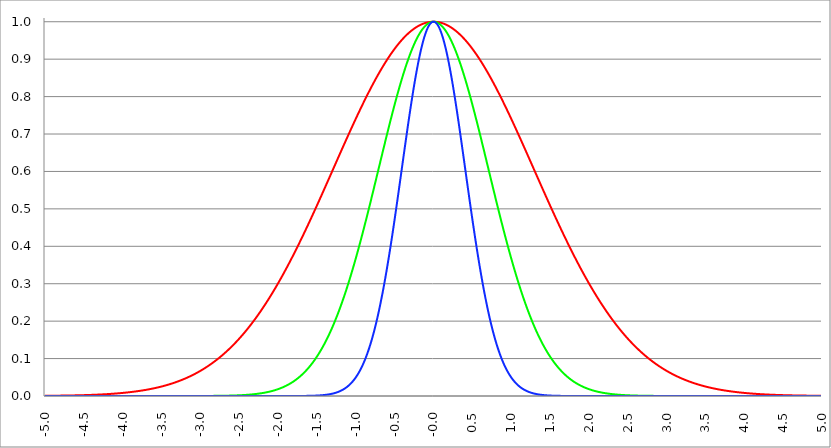
| Category | Series 1 | Series 0 | Series 2 |
|---|---|---|---|
| -5.0 | 0.001 | 0 | 0 |
| -4.995 | 0.001 | 0 | 0 |
| -4.99 | 0.001 | 0 | 0 |
| -4.985 | 0.001 | 0 | 0 |
| -4.98 | 0.001 | 0 | 0 |
| -4.975 | 0.001 | 0 | 0 |
| -4.97 | 0.001 | 0 | 0 |
| -4.965000000000001 | 0.001 | 0 | 0 |
| -4.960000000000001 | 0.001 | 0 | 0 |
| -4.955000000000001 | 0.001 | 0 | 0 |
| -4.950000000000001 | 0.001 | 0 | 0 |
| -4.945000000000001 | 0.001 | 0 | 0 |
| -4.940000000000001 | 0.001 | 0 | 0 |
| -4.935000000000001 | 0.001 | 0 | 0 |
| -4.930000000000001 | 0.001 | 0 | 0 |
| -4.925000000000002 | 0.001 | 0 | 0 |
| -4.920000000000002 | 0.001 | 0 | 0 |
| -4.915000000000002 | 0.001 | 0 | 0 |
| -4.910000000000002 | 0.001 | 0 | 0 |
| -4.905000000000002 | 0.001 | 0 | 0 |
| -4.900000000000002 | 0.001 | 0 | 0 |
| -4.895000000000002 | 0.001 | 0 | 0 |
| -4.890000000000002 | 0.001 | 0 | 0 |
| -4.885000000000002 | 0.001 | 0 | 0 |
| -4.880000000000002 | 0.001 | 0 | 0 |
| -4.875000000000003 | 0.001 | 0 | 0 |
| -4.870000000000003 | 0.001 | 0 | 0 |
| -4.865000000000003 | 0.001 | 0 | 0 |
| -4.860000000000003 | 0.001 | 0 | 0 |
| -4.855000000000003 | 0.001 | 0 | 0 |
| -4.850000000000003 | 0.001 | 0 | 0 |
| -4.845000000000003 | 0.001 | 0 | 0 |
| -4.840000000000003 | 0.001 | 0 | 0 |
| -4.835000000000003 | 0.001 | 0 | 0 |
| -4.830000000000004 | 0.001 | 0 | 0 |
| -4.825000000000004 | 0.001 | 0 | 0 |
| -4.820000000000004 | 0.001 | 0 | 0 |
| -4.815000000000004 | 0.001 | 0 | 0 |
| -4.810000000000004 | 0.001 | 0 | 0 |
| -4.805000000000004 | 0.001 | 0 | 0 |
| -4.800000000000004 | 0.001 | 0 | 0 |
| -4.795000000000004 | 0.001 | 0 | 0 |
| -4.790000000000004 | 0.001 | 0 | 0 |
| -4.785000000000004 | 0.001 | 0 | 0 |
| -4.780000000000004 | 0.001 | 0 | 0 |
| -4.775000000000004 | 0.001 | 0 | 0 |
| -4.770000000000004 | 0.001 | 0 | 0 |
| -4.765000000000005 | 0.001 | 0 | 0 |
| -4.760000000000005 | 0.001 | 0 | 0 |
| -4.755000000000005 | 0.001 | 0 | 0 |
| -4.750000000000005 | 0.001 | 0 | 0 |
| -4.745000000000005 | 0.001 | 0 | 0 |
| -4.740000000000005 | 0.001 | 0 | 0 |
| -4.735000000000005 | 0.001 | 0 | 0 |
| -4.730000000000005 | 0.001 | 0 | 0 |
| -4.725000000000006 | 0.001 | 0 | 0 |
| -4.720000000000006 | 0.001 | 0 | 0 |
| -4.715000000000006 | 0.001 | 0 | 0 |
| -4.710000000000006 | 0.001 | 0 | 0 |
| -4.705000000000006 | 0.001 | 0 | 0 |
| -4.700000000000006 | 0.001 | 0 | 0 |
| -4.695000000000006 | 0.001 | 0 | 0 |
| -4.690000000000006 | 0.001 | 0 | 0 |
| -4.685000000000007 | 0.001 | 0 | 0 |
| -4.680000000000007 | 0.001 | 0 | 0 |
| -4.675000000000007 | 0.001 | 0 | 0 |
| -4.670000000000007 | 0.001 | 0 | 0 |
| -4.665000000000007 | 0.001 | 0 | 0 |
| -4.660000000000007 | 0.001 | 0 | 0 |
| -4.655000000000007 | 0.002 | 0 | 0 |
| -4.650000000000007 | 0.002 | 0 | 0 |
| -4.645000000000007 | 0.002 | 0 | 0 |
| -4.640000000000008 | 0.002 | 0 | 0 |
| -4.635000000000008 | 0.002 | 0 | 0 |
| -4.630000000000008 | 0.002 | 0 | 0 |
| -4.625000000000008 | 0.002 | 0 | 0 |
| -4.620000000000008 | 0.002 | 0 | 0 |
| -4.615000000000008 | 0.002 | 0 | 0 |
| -4.610000000000008 | 0.002 | 0 | 0 |
| -4.605000000000008 | 0.002 | 0 | 0 |
| -4.600000000000008 | 0.002 | 0 | 0 |
| -4.595000000000009 | 0.002 | 0 | 0 |
| -4.590000000000009 | 0.002 | 0 | 0 |
| -4.585000000000009 | 0.002 | 0 | 0 |
| -4.580000000000009 | 0.002 | 0 | 0 |
| -4.57500000000001 | 0.002 | 0 | 0 |
| -4.57000000000001 | 0.002 | 0 | 0 |
| -4.565000000000009 | 0.002 | 0 | 0 |
| -4.560000000000009 | 0.002 | 0 | 0 |
| -4.555000000000009 | 0.002 | 0 | 0 |
| -4.55000000000001 | 0.002 | 0 | 0 |
| -4.54500000000001 | 0.002 | 0 | 0 |
| -4.54000000000001 | 0.002 | 0 | 0 |
| -4.53500000000001 | 0.002 | 0 | 0 |
| -4.53000000000001 | 0.002 | 0 | 0 |
| -4.52500000000001 | 0.002 | 0 | 0 |
| -4.52000000000001 | 0.002 | 0 | 0 |
| -4.51500000000001 | 0.002 | 0 | 0 |
| -4.51000000000001 | 0.002 | 0 | 0 |
| -4.505000000000011 | 0.002 | 0 | 0 |
| -4.500000000000011 | 0.002 | 0 | 0 |
| -4.495000000000011 | 0.002 | 0 | 0 |
| -4.490000000000011 | 0.002 | 0 | 0 |
| -4.485000000000011 | 0.002 | 0 | 0 |
| -4.480000000000011 | 0.002 | 0 | 0 |
| -4.475000000000011 | 0.002 | 0 | 0 |
| -4.470000000000011 | 0.002 | 0 | 0 |
| -4.465000000000011 | 0.003 | 0 | 0 |
| -4.460000000000011 | 0.003 | 0 | 0 |
| -4.455000000000012 | 0.003 | 0 | 0 |
| -4.450000000000012 | 0.003 | 0 | 0 |
| -4.445000000000012 | 0.003 | 0 | 0 |
| -4.440000000000012 | 0.003 | 0 | 0 |
| -4.435000000000012 | 0.003 | 0 | 0 |
| -4.430000000000012 | 0.003 | 0 | 0 |
| -4.425000000000012 | 0.003 | 0 | 0 |
| -4.420000000000012 | 0.003 | 0 | 0 |
| -4.415000000000012 | 0.003 | 0 | 0 |
| -4.410000000000013 | 0.003 | 0 | 0 |
| -4.405000000000013 | 0.003 | 0 | 0 |
| -4.400000000000013 | 0.003 | 0 | 0 |
| -4.395000000000013 | 0.003 | 0 | 0 |
| -4.390000000000013 | 0.003 | 0 | 0 |
| -4.385000000000013 | 0.003 | 0 | 0 |
| -4.380000000000013 | 0.003 | 0 | 0 |
| -4.375000000000013 | 0.003 | 0 | 0 |
| -4.370000000000013 | 0.003 | 0 | 0 |
| -4.365000000000013 | 0.003 | 0 | 0 |
| -4.360000000000014 | 0.003 | 0 | 0 |
| -4.355000000000014 | 0.003 | 0 | 0 |
| -4.350000000000014 | 0.003 | 0 | 0 |
| -4.345000000000014 | 0.003 | 0 | 0 |
| -4.340000000000014 | 0.004 | 0 | 0 |
| -4.335000000000014 | 0.004 | 0 | 0 |
| -4.330000000000014 | 0.004 | 0 | 0 |
| -4.325000000000014 | 0.004 | 0 | 0 |
| -4.320000000000014 | 0.004 | 0 | 0 |
| -4.315000000000015 | 0.004 | 0 | 0 |
| -4.310000000000015 | 0.004 | 0 | 0 |
| -4.305000000000015 | 0.004 | 0 | 0 |
| -4.300000000000015 | 0.004 | 0 | 0 |
| -4.295000000000015 | 0.004 | 0 | 0 |
| -4.290000000000015 | 0.004 | 0 | 0 |
| -4.285000000000015 | 0.004 | 0 | 0 |
| -4.280000000000015 | 0.004 | 0 | 0 |
| -4.275000000000015 | 0.004 | 0 | 0 |
| -4.270000000000015 | 0.004 | 0 | 0 |
| -4.265000000000016 | 0.004 | 0 | 0 |
| -4.260000000000016 | 0.004 | 0 | 0 |
| -4.255000000000016 | 0.004 | 0 | 0 |
| -4.250000000000016 | 0.004 | 0 | 0 |
| -4.245000000000016 | 0.004 | 0 | 0 |
| -4.240000000000016 | 0.005 | 0 | 0 |
| -4.235000000000016 | 0.005 | 0 | 0 |
| -4.230000000000016 | 0.005 | 0 | 0 |
| -4.225000000000017 | 0.005 | 0 | 0 |
| -4.220000000000017 | 0.005 | 0 | 0 |
| -4.215000000000017 | 0.005 | 0 | 0 |
| -4.210000000000017 | 0.005 | 0 | 0 |
| -4.205000000000017 | 0.005 | 0 | 0 |
| -4.200000000000017 | 0.005 | 0 | 0 |
| -4.195000000000017 | 0.005 | 0 | 0 |
| -4.190000000000017 | 0.005 | 0 | 0 |
| -4.185000000000017 | 0.005 | 0 | 0 |
| -4.180000000000017 | 0.005 | 0 | 0 |
| -4.175000000000018 | 0.005 | 0 | 0 |
| -4.170000000000018 | 0.005 | 0 | 0 |
| -4.165000000000018 | 0.005 | 0 | 0 |
| -4.160000000000018 | 0.006 | 0 | 0 |
| -4.155000000000018 | 0.006 | 0 | 0 |
| -4.150000000000018 | 0.006 | 0 | 0 |
| -4.145000000000018 | 0.006 | 0 | 0 |
| -4.140000000000018 | 0.006 | 0 | 0 |
| -4.135000000000018 | 0.006 | 0 | 0 |
| -4.130000000000019 | 0.006 | 0 | 0 |
| -4.125000000000019 | 0.006 | 0 | 0 |
| -4.120000000000019 | 0.006 | 0 | 0 |
| -4.115000000000019 | 0.006 | 0 | 0 |
| -4.110000000000019 | 0.006 | 0 | 0 |
| -4.105000000000019 | 0.006 | 0 | 0 |
| -4.100000000000019 | 0.006 | 0 | 0 |
| -4.095000000000019 | 0.007 | 0 | 0 |
| -4.090000000000019 | 0.007 | 0 | 0 |
| -4.085000000000019 | 0.007 | 0 | 0 |
| -4.08000000000002 | 0.007 | 0 | 0 |
| -4.07500000000002 | 0.007 | 0 | 0 |
| -4.07000000000002 | 0.007 | 0 | 0 |
| -4.06500000000002 | 0.007 | 0 | 0 |
| -4.06000000000002 | 0.007 | 0 | 0 |
| -4.05500000000002 | 0.007 | 0 | 0 |
| -4.05000000000002 | 0.007 | 0 | 0 |
| -4.04500000000002 | 0.007 | 0 | 0 |
| -4.04000000000002 | 0.007 | 0 | 0 |
| -4.03500000000002 | 0.008 | 0 | 0 |
| -4.03000000000002 | 0.008 | 0 | 0 |
| -4.025000000000021 | 0.008 | 0 | 0 |
| -4.020000000000021 | 0.008 | 0 | 0 |
| -4.015000000000021 | 0.008 | 0 | 0 |
| -4.010000000000021 | 0.008 | 0 | 0 |
| -4.005000000000021 | 0.008 | 0 | 0 |
| -4.000000000000021 | 0.008 | 0 | 0 |
| -3.995000000000021 | 0.008 | 0 | 0 |
| -3.990000000000021 | 0.008 | 0 | 0 |
| -3.985000000000022 | 0.009 | 0 | 0 |
| -3.980000000000022 | 0.009 | 0 | 0 |
| -3.975000000000022 | 0.009 | 0 | 0 |
| -3.970000000000022 | 0.009 | 0 | 0 |
| -3.965000000000022 | 0.009 | 0 | 0 |
| -3.960000000000022 | 0.009 | 0 | 0 |
| -3.955000000000022 | 0.009 | 0 | 0 |
| -3.950000000000022 | 0.009 | 0 | 0 |
| -3.945000000000022 | 0.009 | 0 | 0 |
| -3.940000000000023 | 0.009 | 0 | 0 |
| -3.935000000000023 | 0.01 | 0 | 0 |
| -3.930000000000023 | 0.01 | 0 | 0 |
| -3.925000000000023 | 0.01 | 0 | 0 |
| -3.920000000000023 | 0.01 | 0 | 0 |
| -3.915000000000023 | 0.01 | 0 | 0 |
| -3.910000000000023 | 0.01 | 0 | 0 |
| -3.905000000000023 | 0.01 | 0 | 0 |
| -3.900000000000023 | 0.01 | 0 | 0 |
| -3.895000000000023 | 0.011 | 0 | 0 |
| -3.890000000000024 | 0.011 | 0 | 0 |
| -3.885000000000024 | 0.011 | 0 | 0 |
| -3.880000000000024 | 0.011 | 0 | 0 |
| -3.875000000000024 | 0.011 | 0 | 0 |
| -3.870000000000024 | 0.011 | 0 | 0 |
| -3.865000000000024 | 0.011 | 0 | 0 |
| -3.860000000000024 | 0.011 | 0 | 0 |
| -3.855000000000024 | 0.012 | 0 | 0 |
| -3.850000000000024 | 0.012 | 0 | 0 |
| -3.845000000000025 | 0.012 | 0 | 0 |
| -3.840000000000025 | 0.012 | 0 | 0 |
| -3.835000000000025 | 0.012 | 0 | 0 |
| -3.830000000000025 | 0.012 | 0 | 0 |
| -3.825000000000025 | 0.012 | 0 | 0 |
| -3.820000000000025 | 0.013 | 0 | 0 |
| -3.815000000000025 | 0.013 | 0 | 0 |
| -3.810000000000025 | 0.013 | 0 | 0 |
| -3.805000000000025 | 0.013 | 0 | 0 |
| -3.800000000000026 | 0.013 | 0 | 0 |
| -3.795000000000026 | 0.013 | 0 | 0 |
| -3.790000000000026 | 0.013 | 0 | 0 |
| -3.785000000000026 | 0.014 | 0 | 0 |
| -3.780000000000026 | 0.014 | 0 | 0 |
| -3.775000000000026 | 0.014 | 0 | 0 |
| -3.770000000000026 | 0.014 | 0 | 0 |
| -3.765000000000026 | 0.014 | 0 | 0 |
| -3.760000000000026 | 0.014 | 0 | 0 |
| -3.755000000000026 | 0.015 | 0 | 0 |
| -3.750000000000027 | 0.015 | 0 | 0 |
| -3.745000000000027 | 0.015 | 0 | 0 |
| -3.740000000000027 | 0.015 | 0 | 0 |
| -3.735000000000027 | 0.015 | 0 | 0 |
| -3.730000000000027 | 0.015 | 0 | 0 |
| -3.725000000000027 | 0.016 | 0 | 0 |
| -3.720000000000027 | 0.016 | 0 | 0 |
| -3.715000000000027 | 0.016 | 0 | 0 |
| -3.710000000000027 | 0.016 | 0 | 0 |
| -3.705000000000028 | 0.016 | 0 | 0 |
| -3.700000000000028 | 0.016 | 0 | 0 |
| -3.695000000000028 | 0.017 | 0 | 0 |
| -3.690000000000028 | 0.017 | 0 | 0 |
| -3.685000000000028 | 0.017 | 0 | 0 |
| -3.680000000000028 | 0.017 | 0 | 0 |
| -3.675000000000028 | 0.017 | 0 | 0 |
| -3.670000000000028 | 0.018 | 0 | 0 |
| -3.665000000000028 | 0.018 | 0 | 0 |
| -3.660000000000028 | 0.018 | 0 | 0 |
| -3.655000000000029 | 0.018 | 0 | 0 |
| -3.650000000000029 | 0.018 | 0 | 0 |
| -3.645000000000029 | 0.019 | 0 | 0 |
| -3.640000000000029 | 0.019 | 0 | 0 |
| -3.635000000000029 | 0.019 | 0 | 0 |
| -3.630000000000029 | 0.019 | 0 | 0 |
| -3.625000000000029 | 0.019 | 0 | 0 |
| -3.620000000000029 | 0.02 | 0 | 0 |
| -3.615000000000029 | 0.02 | 0 | 0 |
| -3.61000000000003 | 0.02 | 0 | 0 |
| -3.60500000000003 | 0.02 | 0 | 0 |
| -3.60000000000003 | 0.02 | 0 | 0 |
| -3.59500000000003 | 0.021 | 0 | 0 |
| -3.59000000000003 | 0.021 | 0 | 0 |
| -3.58500000000003 | 0.021 | 0 | 0 |
| -3.58000000000003 | 0.021 | 0 | 0 |
| -3.57500000000003 | 0.022 | 0 | 0 |
| -3.57000000000003 | 0.022 | 0 | 0 |
| -3.565000000000031 | 0.022 | 0 | 0 |
| -3.560000000000031 | 0.022 | 0 | 0 |
| -3.555000000000031 | 0.023 | 0 | 0 |
| -3.550000000000031 | 0.023 | 0 | 0 |
| -3.545000000000031 | 0.023 | 0 | 0 |
| -3.540000000000031 | 0.023 | 0 | 0 |
| -3.535000000000031 | 0.024 | 0 | 0 |
| -3.530000000000031 | 0.024 | 0 | 0 |
| -3.525000000000031 | 0.024 | 0 | 0 |
| -3.520000000000032 | 0.024 | 0 | 0 |
| -3.515000000000032 | 0.025 | 0 | 0 |
| -3.510000000000032 | 0.025 | 0 | 0 |
| -3.505000000000032 | 0.025 | 0 | 0 |
| -3.500000000000032 | 0.025 | 0 | 0 |
| -3.495000000000032 | 0.026 | 0 | 0 |
| -3.490000000000032 | 0.026 | 0 | 0 |
| -3.485000000000032 | 0.026 | 0 | 0 |
| -3.480000000000032 | 0.026 | 0 | 0 |
| -3.475000000000032 | 0.027 | 0 | 0 |
| -3.470000000000033 | 0.027 | 0 | 0 |
| -3.465000000000033 | 0.027 | 0 | 0 |
| -3.460000000000033 | 0.028 | 0 | 0 |
| -3.455000000000033 | 0.028 | 0 | 0 |
| -3.450000000000033 | 0.028 | 0 | 0 |
| -3.445000000000033 | 0.028 | 0 | 0 |
| -3.440000000000033 | 0.029 | 0 | 0 |
| -3.435000000000033 | 0.029 | 0 | 0 |
| -3.430000000000033 | 0.029 | 0 | 0 |
| -3.425000000000034 | 0.03 | 0 | 0 |
| -3.420000000000034 | 0.03 | 0 | 0 |
| -3.415000000000034 | 0.03 | 0 | 0 |
| -3.410000000000034 | 0.031 | 0 | 0 |
| -3.405000000000034 | 0.031 | 0 | 0 |
| -3.400000000000034 | 0.031 | 0 | 0 |
| -3.395000000000034 | 0.031 | 0 | 0 |
| -3.390000000000034 | 0.032 | 0 | 0 |
| -3.385000000000034 | 0.032 | 0 | 0 |
| -3.380000000000034 | 0.032 | 0 | 0 |
| -3.375000000000035 | 0.033 | 0 | 0 |
| -3.370000000000035 | 0.033 | 0 | 0 |
| -3.365000000000035 | 0.033 | 0 | 0 |
| -3.360000000000035 | 0.034 | 0 | 0 |
| -3.355000000000035 | 0.034 | 0 | 0 |
| -3.350000000000035 | 0.035 | 0 | 0 |
| -3.345000000000035 | 0.035 | 0 | 0 |
| -3.340000000000035 | 0.035 | 0 | 0 |
| -3.335000000000035 | 0.036 | 0 | 0 |
| -3.330000000000036 | 0.036 | 0 | 0 |
| -3.325000000000036 | 0.036 | 0 | 0 |
| -3.320000000000036 | 0.037 | 0 | 0 |
| -3.315000000000036 | 0.037 | 0 | 0 |
| -3.310000000000036 | 0.037 | 0 | 0 |
| -3.305000000000036 | 0.038 | 0 | 0 |
| -3.300000000000036 | 0.038 | 0 | 0 |
| -3.295000000000036 | 0.038 | 0 | 0 |
| -3.290000000000036 | 0.039 | 0 | 0 |
| -3.285000000000036 | 0.039 | 0 | 0 |
| -3.280000000000036 | 0.04 | 0 | 0 |
| -3.275000000000037 | 0.04 | 0 | 0 |
| -3.270000000000037 | 0.04 | 0 | 0 |
| -3.265000000000037 | 0.041 | 0 | 0 |
| -3.260000000000037 | 0.041 | 0 | 0 |
| -3.255000000000037 | 0.042 | 0 | 0 |
| -3.250000000000037 | 0.042 | 0 | 0 |
| -3.245000000000037 | 0.042 | 0 | 0 |
| -3.240000000000037 | 0.043 | 0 | 0 |
| -3.235000000000038 | 0.043 | 0 | 0 |
| -3.230000000000038 | 0.044 | 0 | 0 |
| -3.225000000000038 | 0.044 | 0 | 0 |
| -3.220000000000038 | 0.045 | 0 | 0 |
| -3.215000000000038 | 0.045 | 0 | 0 |
| -3.210000000000038 | 0.045 | 0 | 0 |
| -3.205000000000038 | 0.046 | 0 | 0 |
| -3.200000000000038 | 0.046 | 0 | 0 |
| -3.195000000000038 | 0.047 | 0 | 0 |
| -3.190000000000039 | 0.047 | 0 | 0 |
| -3.185000000000039 | 0.048 | 0 | 0 |
| -3.180000000000039 | 0.048 | 0 | 0 |
| -3.175000000000039 | 0.049 | 0 | 0 |
| -3.170000000000039 | 0.049 | 0 | 0 |
| -3.16500000000004 | 0.05 | 0 | 0 |
| -3.16000000000004 | 0.05 | 0 | 0 |
| -3.155000000000039 | 0.05 | 0 | 0 |
| -3.150000000000039 | 0.051 | 0 | 0 |
| -3.14500000000004 | 0.051 | 0 | 0 |
| -3.14000000000004 | 0.052 | 0 | 0 |
| -3.13500000000004 | 0.052 | 0 | 0 |
| -3.13000000000004 | 0.053 | 0 | 0 |
| -3.12500000000004 | 0.053 | 0 | 0 |
| -3.12000000000004 | 0.054 | 0 | 0 |
| -3.11500000000004 | 0.054 | 0 | 0 |
| -3.11000000000004 | 0.055 | 0 | 0 |
| -3.10500000000004 | 0.055 | 0 | 0 |
| -3.10000000000004 | 0.056 | 0 | 0 |
| -3.095000000000041 | 0.056 | 0 | 0 |
| -3.090000000000041 | 0.057 | 0 | 0 |
| -3.085000000000041 | 0.058 | 0 | 0 |
| -3.080000000000041 | 0.058 | 0 | 0 |
| -3.075000000000041 | 0.059 | 0 | 0 |
| -3.070000000000041 | 0.059 | 0 | 0 |
| -3.065000000000041 | 0.06 | 0 | 0 |
| -3.060000000000041 | 0.06 | 0 | 0 |
| -3.055000000000041 | 0.061 | 0 | 0 |
| -3.050000000000042 | 0.061 | 0 | 0 |
| -3.045000000000042 | 0.062 | 0 | 0 |
| -3.040000000000042 | 0.063 | 0 | 0 |
| -3.035000000000042 | 0.063 | 0 | 0 |
| -3.030000000000042 | 0.064 | 0 | 0 |
| -3.025000000000042 | 0.064 | 0 | 0 |
| -3.020000000000042 | 0.065 | 0 | 0 |
| -3.015000000000042 | 0.065 | 0 | 0 |
| -3.010000000000042 | 0.066 | 0 | 0 |
| -3.005000000000043 | 0.067 | 0 | 0 |
| -3.000000000000043 | 0.067 | 0 | 0 |
| -2.995000000000043 | 0.068 | 0 | 0 |
| -2.990000000000043 | 0.068 | 0 | 0 |
| -2.985000000000043 | 0.069 | 0 | 0 |
| -2.980000000000043 | 0.07 | 0 | 0 |
| -2.975000000000043 | 0.07 | 0 | 0 |
| -2.970000000000043 | 0.071 | 0 | 0 |
| -2.965000000000043 | 0.072 | 0 | 0 |
| -2.960000000000043 | 0.072 | 0 | 0 |
| -2.955000000000044 | 0.073 | 0 | 0 |
| -2.950000000000044 | 0.073 | 0 | 0 |
| -2.945000000000044 | 0.074 | 0 | 0 |
| -2.940000000000044 | 0.075 | 0 | 0 |
| -2.935000000000044 | 0.075 | 0 | 0 |
| -2.930000000000044 | 0.076 | 0 | 0 |
| -2.925000000000044 | 0.077 | 0 | 0 |
| -2.920000000000044 | 0.077 | 0 | 0 |
| -2.915000000000044 | 0.078 | 0 | 0 |
| -2.910000000000045 | 0.079 | 0 | 0 |
| -2.905000000000045 | 0.08 | 0 | 0 |
| -2.900000000000045 | 0.08 | 0 | 0 |
| -2.895000000000045 | 0.081 | 0 | 0 |
| -2.890000000000045 | 0.082 | 0 | 0 |
| -2.885000000000045 | 0.082 | 0 | 0 |
| -2.880000000000045 | 0.083 | 0 | 0 |
| -2.875000000000045 | 0.084 | 0 | 0 |
| -2.870000000000045 | 0.084 | 0 | 0 |
| -2.865000000000045 | 0.085 | 0 | 0 |
| -2.860000000000046 | 0.086 | 0 | 0 |
| -2.855000000000046 | 0.087 | 0 | 0 |
| -2.850000000000046 | 0.087 | 0 | 0 |
| -2.845000000000046 | 0.088 | 0 | 0 |
| -2.840000000000046 | 0.089 | 0 | 0 |
| -2.835000000000046 | 0.09 | 0 | 0 |
| -2.830000000000046 | 0.09 | 0 | 0 |
| -2.825000000000046 | 0.091 | 0 | 0 |
| -2.820000000000046 | 0.092 | 0 | 0 |
| -2.815000000000047 | 0.093 | 0 | 0 |
| -2.810000000000047 | 0.094 | 0 | 0 |
| -2.805000000000047 | 0.094 | 0 | 0 |
| -2.800000000000047 | 0.095 | 0 | 0 |
| -2.795000000000047 | 0.096 | 0 | 0 |
| -2.790000000000047 | 0.097 | 0 | 0 |
| -2.785000000000047 | 0.098 | 0 | 0 |
| -2.780000000000047 | 0.098 | 0 | 0 |
| -2.775000000000047 | 0.099 | 0 | 0 |
| -2.770000000000047 | 0.1 | 0 | 0 |
| -2.765000000000048 | 0.101 | 0 | 0 |
| -2.760000000000048 | 0.102 | 0 | 0 |
| -2.755000000000048 | 0.103 | 0.001 | 0 |
| -2.750000000000048 | 0.103 | 0.001 | 0 |
| -2.745000000000048 | 0.104 | 0.001 | 0 |
| -2.740000000000048 | 0.105 | 0.001 | 0 |
| -2.735000000000048 | 0.106 | 0.001 | 0 |
| -2.730000000000048 | 0.107 | 0.001 | 0 |
| -2.725000000000048 | 0.108 | 0.001 | 0 |
| -2.720000000000049 | 0.109 | 0.001 | 0 |
| -2.715000000000049 | 0.11 | 0.001 | 0 |
| -2.710000000000049 | 0.11 | 0.001 | 0 |
| -2.705000000000049 | 0.111 | 0.001 | 0 |
| -2.700000000000049 | 0.112 | 0.001 | 0 |
| -2.695000000000049 | 0.113 | 0.001 | 0 |
| -2.690000000000049 | 0.114 | 0.001 | 0 |
| -2.685000000000049 | 0.115 | 0.001 | 0 |
| -2.680000000000049 | 0.116 | 0.001 | 0 |
| -2.675000000000049 | 0.117 | 0.001 | 0 |
| -2.67000000000005 | 0.118 | 0.001 | 0 |
| -2.66500000000005 | 0.119 | 0.001 | 0 |
| -2.66000000000005 | 0.12 | 0.001 | 0 |
| -2.65500000000005 | 0.121 | 0.001 | 0 |
| -2.65000000000005 | 0.122 | 0.001 | 0 |
| -2.64500000000005 | 0.123 | 0.001 | 0 |
| -2.64000000000005 | 0.124 | 0.001 | 0 |
| -2.63500000000005 | 0.125 | 0.001 | 0 |
| -2.63000000000005 | 0.126 | 0.001 | 0 |
| -2.625000000000051 | 0.127 | 0.001 | 0 |
| -2.620000000000051 | 0.128 | 0.001 | 0 |
| -2.615000000000051 | 0.129 | 0.001 | 0 |
| -2.610000000000051 | 0.13 | 0.001 | 0 |
| -2.605000000000051 | 0.131 | 0.001 | 0 |
| -2.600000000000051 | 0.132 | 0.001 | 0 |
| -2.595000000000051 | 0.133 | 0.001 | 0 |
| -2.590000000000051 | 0.134 | 0.001 | 0 |
| -2.585000000000051 | 0.135 | 0.001 | 0 |
| -2.580000000000052 | 0.136 | 0.001 | 0 |
| -2.575000000000052 | 0.137 | 0.001 | 0 |
| -2.570000000000052 | 0.138 | 0.001 | 0 |
| -2.565000000000052 | 0.139 | 0.001 | 0 |
| -2.560000000000052 | 0.14 | 0.001 | 0 |
| -2.555000000000052 | 0.141 | 0.001 | 0 |
| -2.550000000000052 | 0.142 | 0.001 | 0 |
| -2.545000000000052 | 0.143 | 0.002 | 0 |
| -2.540000000000052 | 0.144 | 0.002 | 0 |
| -2.535000000000053 | 0.145 | 0.002 | 0 |
| -2.530000000000053 | 0.147 | 0.002 | 0 |
| -2.525000000000053 | 0.148 | 0.002 | 0 |
| -2.520000000000053 | 0.149 | 0.002 | 0 |
| -2.515000000000053 | 0.15 | 0.002 | 0 |
| -2.510000000000053 | 0.151 | 0.002 | 0 |
| -2.505000000000053 | 0.152 | 0.002 | 0 |
| -2.500000000000053 | 0.153 | 0.002 | 0 |
| -2.495000000000053 | 0.155 | 0.002 | 0 |
| -2.490000000000053 | 0.156 | 0.002 | 0 |
| -2.485000000000054 | 0.157 | 0.002 | 0 |
| -2.480000000000054 | 0.158 | 0.002 | 0 |
| -2.475000000000054 | 0.159 | 0.002 | 0 |
| -2.470000000000054 | 0.16 | 0.002 | 0 |
| -2.465000000000054 | 0.162 | 0.002 | 0 |
| -2.460000000000054 | 0.163 | 0.002 | 0 |
| -2.455000000000054 | 0.164 | 0.002 | 0 |
| -2.450000000000054 | 0.165 | 0.002 | 0 |
| -2.445000000000054 | 0.166 | 0.003 | 0 |
| -2.440000000000055 | 0.168 | 0.003 | 0 |
| -2.435000000000055 | 0.169 | 0.003 | 0 |
| -2.430000000000055 | 0.17 | 0.003 | 0 |
| -2.425000000000055 | 0.171 | 0.003 | 0 |
| -2.420000000000055 | 0.173 | 0.003 | 0 |
| -2.415000000000055 | 0.174 | 0.003 | 0 |
| -2.410000000000055 | 0.175 | 0.003 | 0 |
| -2.405000000000055 | 0.176 | 0.003 | 0 |
| -2.400000000000055 | 0.178 | 0.003 | 0 |
| -2.395000000000055 | 0.179 | 0.003 | 0 |
| -2.390000000000056 | 0.18 | 0.003 | 0 |
| -2.385000000000056 | 0.182 | 0.003 | 0 |
| -2.380000000000056 | 0.183 | 0.003 | 0 |
| -2.375000000000056 | 0.184 | 0.004 | 0 |
| -2.370000000000056 | 0.185 | 0.004 | 0 |
| -2.365000000000056 | 0.187 | 0.004 | 0 |
| -2.360000000000056 | 0.188 | 0.004 | 0 |
| -2.355000000000056 | 0.189 | 0.004 | 0 |
| -2.350000000000056 | 0.191 | 0.004 | 0 |
| -2.345000000000057 | 0.192 | 0.004 | 0 |
| -2.340000000000057 | 0.193 | 0.004 | 0 |
| -2.335000000000057 | 0.195 | 0.004 | 0 |
| -2.330000000000057 | 0.196 | 0.004 | 0 |
| -2.325000000000057 | 0.198 | 0.004 | 0 |
| -2.320000000000057 | 0.199 | 0.005 | 0 |
| -2.315000000000057 | 0.2 | 0.005 | 0 |
| -2.310000000000057 | 0.202 | 0.005 | 0 |
| -2.305000000000057 | 0.203 | 0.005 | 0 |
| -2.300000000000058 | 0.205 | 0.005 | 0 |
| -2.295000000000058 | 0.206 | 0.005 | 0 |
| -2.290000000000058 | 0.207 | 0.005 | 0 |
| -2.285000000000058 | 0.209 | 0.005 | 0 |
| -2.280000000000058 | 0.21 | 0.006 | 0 |
| -2.275000000000058 | 0.212 | 0.006 | 0 |
| -2.270000000000058 | 0.213 | 0.006 | 0 |
| -2.265000000000058 | 0.215 | 0.006 | 0 |
| -2.260000000000058 | 0.216 | 0.006 | 0 |
| -2.255000000000058 | 0.218 | 0.006 | 0 |
| -2.250000000000059 | 0.219 | 0.006 | 0 |
| -2.245000000000059 | 0.22 | 0.006 | 0 |
| -2.240000000000059 | 0.222 | 0.007 | 0 |
| -2.235000000000059 | 0.223 | 0.007 | 0 |
| -2.23000000000006 | 0.225 | 0.007 | 0 |
| -2.22500000000006 | 0.226 | 0.007 | 0 |
| -2.22000000000006 | 0.228 | 0.007 | 0 |
| -2.215000000000059 | 0.229 | 0.007 | 0 |
| -2.210000000000059 | 0.231 | 0.008 | 0 |
| -2.20500000000006 | 0.233 | 0.008 | 0 |
| -2.20000000000006 | 0.234 | 0.008 | 0 |
| -2.19500000000006 | 0.236 | 0.008 | 0 |
| -2.19000000000006 | 0.237 | 0.008 | 0 |
| -2.18500000000006 | 0.239 | 0.008 | 0 |
| -2.18000000000006 | 0.24 | 0.009 | 0 |
| -2.17500000000006 | 0.242 | 0.009 | 0 |
| -2.17000000000006 | 0.243 | 0.009 | 0 |
| -2.16500000000006 | 0.245 | 0.009 | 0 |
| -2.160000000000061 | 0.247 | 0.009 | 0 |
| -2.155000000000061 | 0.248 | 0.01 | 0 |
| -2.150000000000061 | 0.25 | 0.01 | 0 |
| -2.145000000000061 | 0.252 | 0.01 | 0 |
| -2.140000000000061 | 0.253 | 0.01 | 0 |
| -2.135000000000061 | 0.255 | 0.01 | 0 |
| -2.130000000000061 | 0.256 | 0.011 | 0 |
| -2.125000000000061 | 0.258 | 0.011 | 0 |
| -2.120000000000061 | 0.26 | 0.011 | 0 |
| -2.115000000000061 | 0.261 | 0.011 | 0 |
| -2.110000000000062 | 0.263 | 0.012 | 0 |
| -2.105000000000062 | 0.265 | 0.012 | 0 |
| -2.100000000000062 | 0.266 | 0.012 | 0 |
| -2.095000000000062 | 0.268 | 0.012 | 0 |
| -2.090000000000062 | 0.27 | 0.013 | 0 |
| -2.085000000000062 | 0.271 | 0.013 | 0 |
| -2.080000000000062 | 0.273 | 0.013 | 0 |
| -2.075000000000062 | 0.275 | 0.013 | 0 |
| -2.070000000000062 | 0.277 | 0.014 | 0 |
| -2.065000000000063 | 0.278 | 0.014 | 0 |
| -2.060000000000063 | 0.28 | 0.014 | 0 |
| -2.055000000000063 | 0.282 | 0.015 | 0 |
| -2.050000000000063 | 0.283 | 0.015 | 0 |
| -2.045000000000063 | 0.285 | 0.015 | 0 |
| -2.040000000000063 | 0.287 | 0.016 | 0 |
| -2.035000000000063 | 0.289 | 0.016 | 0 |
| -2.030000000000063 | 0.29 | 0.016 | 0 |
| -2.025000000000063 | 0.292 | 0.017 | 0 |
| -2.020000000000064 | 0.294 | 0.017 | 0 |
| -2.015000000000064 | 0.296 | 0.017 | 0 |
| -2.010000000000064 | 0.298 | 0.018 | 0 |
| -2.005000000000064 | 0.299 | 0.018 | 0 |
| -2.000000000000064 | 0.301 | 0.018 | 0 |
| -1.995000000000064 | 0.303 | 0.019 | 0 |
| -1.990000000000064 | 0.305 | 0.019 | 0 |
| -1.985000000000064 | 0.307 | 0.019 | 0 |
| -1.980000000000064 | 0.308 | 0.02 | 0 |
| -1.975000000000064 | 0.31 | 0.02 | 0 |
| -1.970000000000065 | 0.312 | 0.021 | 0 |
| -1.965000000000065 | 0.314 | 0.021 | 0 |
| -1.960000000000065 | 0.316 | 0.021 | 0 |
| -1.955000000000065 | 0.318 | 0.022 | 0 |
| -1.950000000000065 | 0.32 | 0.022 | 0 |
| -1.945000000000065 | 0.321 | 0.023 | 0 |
| -1.940000000000065 | 0.323 | 0.023 | 0 |
| -1.935000000000065 | 0.325 | 0.024 | 0 |
| -1.930000000000065 | 0.327 | 0.024 | 0 |
| -1.925000000000066 | 0.329 | 0.025 | 0 |
| -1.920000000000066 | 0.331 | 0.025 | 0 |
| -1.915000000000066 | 0.333 | 0.026 | 0 |
| -1.910000000000066 | 0.335 | 0.026 | 0 |
| -1.905000000000066 | 0.337 | 0.027 | 0 |
| -1.900000000000066 | 0.339 | 0.027 | 0 |
| -1.895000000000066 | 0.341 | 0.028 | 0 |
| -1.890000000000066 | 0.342 | 0.028 | 0 |
| -1.885000000000066 | 0.344 | 0.029 | 0 |
| -1.880000000000066 | 0.346 | 0.029 | 0 |
| -1.875000000000067 | 0.348 | 0.03 | 0 |
| -1.870000000000067 | 0.35 | 0.03 | 0 |
| -1.865000000000067 | 0.352 | 0.031 | 0 |
| -1.860000000000067 | 0.354 | 0.031 | 0 |
| -1.855000000000067 | 0.356 | 0.032 | 0 |
| -1.850000000000067 | 0.358 | 0.033 | 0 |
| -1.845000000000067 | 0.36 | 0.033 | 0 |
| -1.840000000000067 | 0.362 | 0.034 | 0 |
| -1.835000000000067 | 0.364 | 0.034 | 0 |
| -1.830000000000068 | 0.366 | 0.035 | 0 |
| -1.825000000000068 | 0.368 | 0.036 | 0 |
| -1.820000000000068 | 0.37 | 0.036 | 0 |
| -1.815000000000068 | 0.372 | 0.037 | 0 |
| -1.810000000000068 | 0.374 | 0.038 | 0 |
| -1.805000000000068 | 0.376 | 0.038 | 0 |
| -1.800000000000068 | 0.378 | 0.039 | 0 |
| -1.795000000000068 | 0.38 | 0.04 | 0 |
| -1.790000000000068 | 0.382 | 0.041 | 0 |
| -1.785000000000068 | 0.384 | 0.041 | 0 |
| -1.780000000000069 | 0.387 | 0.042 | 0 |
| -1.775000000000069 | 0.389 | 0.043 | 0 |
| -1.770000000000069 | 0.391 | 0.044 | 0 |
| -1.765000000000069 | 0.393 | 0.044 | 0 |
| -1.760000000000069 | 0.395 | 0.045 | 0 |
| -1.75500000000007 | 0.397 | 0.046 | 0 |
| -1.75000000000007 | 0.399 | 0.047 | 0 |
| -1.745000000000069 | 0.401 | 0.048 | 0 |
| -1.740000000000069 | 0.403 | 0.048 | 0 |
| -1.73500000000007 | 0.405 | 0.049 | 0 |
| -1.73000000000007 | 0.407 | 0.05 | 0 |
| -1.72500000000007 | 0.41 | 0.051 | 0 |
| -1.72000000000007 | 0.412 | 0.052 | 0 |
| -1.71500000000007 | 0.414 | 0.053 | 0 |
| -1.71000000000007 | 0.416 | 0.054 | 0 |
| -1.70500000000007 | 0.418 | 0.055 | 0 |
| -1.70000000000007 | 0.42 | 0.056 | 0 |
| -1.69500000000007 | 0.422 | 0.057 | 0 |
| -1.69000000000007 | 0.425 | 0.057 | 0 |
| -1.685000000000071 | 0.427 | 0.058 | 0 |
| -1.680000000000071 | 0.429 | 0.059 | 0 |
| -1.675000000000071 | 0.431 | 0.06 | 0 |
| -1.670000000000071 | 0.433 | 0.061 | 0 |
| -1.665000000000071 | 0.435 | 0.063 | 0 |
| -1.660000000000071 | 0.437 | 0.064 | 0 |
| -1.655000000000071 | 0.44 | 0.065 | 0 |
| -1.650000000000071 | 0.442 | 0.066 | 0 |
| -1.645000000000071 | 0.444 | 0.067 | 0 |
| -1.640000000000072 | 0.446 | 0.068 | 0 |
| -1.635000000000072 | 0.448 | 0.069 | 0 |
| -1.630000000000072 | 0.451 | 0.07 | 0 |
| -1.625000000000072 | 0.453 | 0.071 | 0 |
| -1.620000000000072 | 0.455 | 0.072 | 0 |
| -1.615000000000072 | 0.457 | 0.074 | 0 |
| -1.610000000000072 | 0.459 | 0.075 | 0 |
| -1.605000000000072 | 0.462 | 0.076 | 0 |
| -1.600000000000072 | 0.464 | 0.077 | 0 |
| -1.595000000000073 | 0.466 | 0.079 | 0 |
| -1.590000000000073 | 0.468 | 0.08 | 0.001 |
| -1.585000000000073 | 0.471 | 0.081 | 0.001 |
| -1.580000000000073 | 0.473 | 0.082 | 0.001 |
| -1.575000000000073 | 0.475 | 0.084 | 0.001 |
| -1.570000000000073 | 0.477 | 0.085 | 0.001 |
| -1.565000000000073 | 0.48 | 0.086 | 0.001 |
| -1.560000000000073 | 0.482 | 0.088 | 0.001 |
| -1.555000000000073 | 0.484 | 0.089 | 0.001 |
| -1.550000000000074 | 0.486 | 0.09 | 0.001 |
| -1.545000000000074 | 0.489 | 0.092 | 0.001 |
| -1.540000000000074 | 0.491 | 0.093 | 0.001 |
| -1.535000000000074 | 0.493 | 0.095 | 0.001 |
| -1.530000000000074 | 0.495 | 0.096 | 0.001 |
| -1.525000000000074 | 0.498 | 0.098 | 0.001 |
| -1.520000000000074 | 0.5 | 0.099 | 0.001 |
| -1.515000000000074 | 0.502 | 0.101 | 0.001 |
| -1.510000000000074 | 0.505 | 0.102 | 0.001 |
| -1.505000000000074 | 0.507 | 0.104 | 0.001 |
| -1.500000000000075 | 0.509 | 0.105 | 0.001 |
| -1.495000000000075 | 0.511 | 0.107 | 0.001 |
| -1.490000000000075 | 0.514 | 0.109 | 0.001 |
| -1.485000000000075 | 0.516 | 0.11 | 0.001 |
| -1.480000000000075 | 0.518 | 0.112 | 0.001 |
| -1.475000000000075 | 0.521 | 0.114 | 0.001 |
| -1.470000000000075 | 0.523 | 0.115 | 0.002 |
| -1.465000000000075 | 0.525 | 0.117 | 0.002 |
| -1.460000000000075 | 0.528 | 0.119 | 0.002 |
| -1.455000000000076 | 0.53 | 0.12 | 0.002 |
| -1.450000000000076 | 0.532 | 0.122 | 0.002 |
| -1.445000000000076 | 0.535 | 0.124 | 0.002 |
| -1.440000000000076 | 0.537 | 0.126 | 0.002 |
| -1.435000000000076 | 0.539 | 0.128 | 0.002 |
| -1.430000000000076 | 0.541 | 0.129 | 0.002 |
| -1.425000000000076 | 0.544 | 0.131 | 0.002 |
| -1.420000000000076 | 0.546 | 0.133 | 0.002 |
| -1.415000000000076 | 0.548 | 0.135 | 0.002 |
| -1.410000000000077 | 0.551 | 0.137 | 0.003 |
| -1.405000000000077 | 0.553 | 0.139 | 0.003 |
| -1.400000000000077 | 0.555 | 0.141 | 0.003 |
| -1.395000000000077 | 0.558 | 0.143 | 0.003 |
| -1.390000000000077 | 0.56 | 0.145 | 0.003 |
| -1.385000000000077 | 0.562 | 0.147 | 0.003 |
| -1.380000000000077 | 0.565 | 0.149 | 0.003 |
| -1.375000000000077 | 0.567 | 0.151 | 0.003 |
| -1.370000000000077 | 0.569 | 0.153 | 0.004 |
| -1.365000000000077 | 0.572 | 0.155 | 0.004 |
| -1.360000000000078 | 0.574 | 0.157 | 0.004 |
| -1.355000000000078 | 0.576 | 0.159 | 0.004 |
| -1.350000000000078 | 0.579 | 0.162 | 0.004 |
| -1.345000000000078 | 0.581 | 0.164 | 0.004 |
| -1.340000000000078 | 0.584 | 0.166 | 0.005 |
| -1.335000000000078 | 0.586 | 0.168 | 0.005 |
| -1.330000000000078 | 0.588 | 0.171 | 0.005 |
| -1.325000000000078 | 0.591 | 0.173 | 0.005 |
| -1.320000000000078 | 0.593 | 0.175 | 0.005 |
| -1.315000000000079 | 0.595 | 0.177 | 0.006 |
| -1.310000000000079 | 0.598 | 0.18 | 0.006 |
| -1.305000000000079 | 0.6 | 0.182 | 0.006 |
| -1.300000000000079 | 0.602 | 0.185 | 0.006 |
| -1.295000000000079 | 0.605 | 0.187 | 0.007 |
| -1.29000000000008 | 0.607 | 0.189 | 0.007 |
| -1.285000000000079 | 0.609 | 0.192 | 0.007 |
| -1.280000000000079 | 0.612 | 0.194 | 0.007 |
| -1.275000000000079 | 0.614 | 0.197 | 0.008 |
| -1.270000000000079 | 0.616 | 0.199 | 0.008 |
| -1.26500000000008 | 0.619 | 0.202 | 0.008 |
| -1.26000000000008 | 0.621 | 0.204 | 0.009 |
| -1.25500000000008 | 0.623 | 0.207 | 0.009 |
| -1.25000000000008 | 0.626 | 0.21 | 0.009 |
| -1.24500000000008 | 0.628 | 0.212 | 0.01 |
| -1.24000000000008 | 0.63 | 0.215 | 0.01 |
| -1.23500000000008 | 0.633 | 0.218 | 0.01 |
| -1.23000000000008 | 0.635 | 0.22 | 0.011 |
| -1.22500000000008 | 0.638 | 0.223 | 0.011 |
| -1.220000000000081 | 0.64 | 0.226 | 0.012 |
| -1.215000000000081 | 0.642 | 0.228 | 0.012 |
| -1.210000000000081 | 0.645 | 0.231 | 0.012 |
| -1.205000000000081 | 0.647 | 0.234 | 0.013 |
| -1.200000000000081 | 0.649 | 0.237 | 0.013 |
| -1.195000000000081 | 0.652 | 0.24 | 0.014 |
| -1.190000000000081 | 0.654 | 0.243 | 0.014 |
| -1.185000000000081 | 0.656 | 0.246 | 0.015 |
| -1.180000000000081 | 0.659 | 0.248 | 0.015 |
| -1.175000000000082 | 0.661 | 0.251 | 0.016 |
| -1.170000000000082 | 0.663 | 0.254 | 0.016 |
| -1.165000000000082 | 0.666 | 0.257 | 0.017 |
| -1.160000000000082 | 0.668 | 0.26 | 0.018 |
| -1.155000000000082 | 0.67 | 0.263 | 0.018 |
| -1.150000000000082 | 0.673 | 0.266 | 0.019 |
| -1.145000000000082 | 0.675 | 0.27 | 0.02 |
| -1.140000000000082 | 0.677 | 0.273 | 0.02 |
| -1.135000000000082 | 0.679 | 0.276 | 0.021 |
| -1.130000000000082 | 0.682 | 0.279 | 0.022 |
| -1.125000000000083 | 0.684 | 0.282 | 0.022 |
| -1.120000000000083 | 0.686 | 0.285 | 0.023 |
| -1.115000000000083 | 0.689 | 0.288 | 0.024 |
| -1.110000000000083 | 0.691 | 0.292 | 0.025 |
| -1.105000000000083 | 0.693 | 0.295 | 0.026 |
| -1.100000000000083 | 0.696 | 0.298 | 0.027 |
| -1.095000000000083 | 0.698 | 0.301 | 0.027 |
| -1.090000000000083 | 0.7 | 0.305 | 0.028 |
| -1.085000000000083 | 0.702 | 0.308 | 0.029 |
| -1.080000000000084 | 0.705 | 0.311 | 0.03 |
| -1.075000000000084 | 0.707 | 0.315 | 0.031 |
| -1.070000000000084 | 0.709 | 0.318 | 0.032 |
| -1.065000000000084 | 0.712 | 0.322 | 0.033 |
| -1.060000000000084 | 0.714 | 0.325 | 0.034 |
| -1.055000000000084 | 0.716 | 0.329 | 0.035 |
| -1.050000000000084 | 0.718 | 0.332 | 0.037 |
| -1.045000000000084 | 0.721 | 0.336 | 0.038 |
| -1.040000000000084 | 0.723 | 0.339 | 0.039 |
| -1.035000000000085 | 0.725 | 0.343 | 0.04 |
| -1.030000000000085 | 0.727 | 0.346 | 0.041 |
| -1.025000000000085 | 0.73 | 0.35 | 0.043 |
| -1.020000000000085 | 0.732 | 0.353 | 0.044 |
| -1.015000000000085 | 0.734 | 0.357 | 0.045 |
| -1.010000000000085 | 0.736 | 0.361 | 0.047 |
| -1.005000000000085 | 0.739 | 0.364 | 0.048 |
| -1.000000000000085 | 0.741 | 0.368 | 0.05 |
| -0.995000000000085 | 0.743 | 0.372 | 0.051 |
| -0.990000000000085 | 0.745 | 0.375 | 0.053 |
| -0.985000000000085 | 0.747 | 0.379 | 0.054 |
| -0.980000000000085 | 0.75 | 0.383 | 0.056 |
| -0.975000000000085 | 0.752 | 0.386 | 0.058 |
| -0.970000000000085 | 0.754 | 0.39 | 0.059 |
| -0.965000000000085 | 0.756 | 0.394 | 0.061 |
| -0.960000000000085 | 0.758 | 0.398 | 0.063 |
| -0.955000000000085 | 0.761 | 0.402 | 0.065 |
| -0.950000000000085 | 0.763 | 0.406 | 0.067 |
| -0.945000000000085 | 0.765 | 0.409 | 0.069 |
| -0.940000000000085 | 0.767 | 0.413 | 0.071 |
| -0.935000000000085 | 0.769 | 0.417 | 0.073 |
| -0.930000000000085 | 0.771 | 0.421 | 0.075 |
| -0.925000000000085 | 0.774 | 0.425 | 0.077 |
| -0.920000000000085 | 0.776 | 0.429 | 0.079 |
| -0.915000000000085 | 0.778 | 0.433 | 0.081 |
| -0.910000000000085 | 0.78 | 0.437 | 0.083 |
| -0.905000000000085 | 0.782 | 0.441 | 0.086 |
| -0.900000000000085 | 0.784 | 0.445 | 0.088 |
| -0.895000000000085 | 0.786 | 0.449 | 0.09 |
| -0.890000000000085 | 0.788 | 0.453 | 0.093 |
| -0.885000000000085 | 0.791 | 0.457 | 0.095 |
| -0.880000000000085 | 0.793 | 0.461 | 0.098 |
| -0.875000000000085 | 0.795 | 0.465 | 0.101 |
| -0.870000000000085 | 0.797 | 0.469 | 0.103 |
| -0.865000000000085 | 0.799 | 0.473 | 0.106 |
| -0.860000000000085 | 0.801 | 0.477 | 0.109 |
| -0.855000000000085 | 0.803 | 0.481 | 0.112 |
| -0.850000000000085 | 0.805 | 0.486 | 0.114 |
| -0.845000000000085 | 0.807 | 0.49 | 0.117 |
| -0.840000000000085 | 0.809 | 0.494 | 0.12 |
| -0.835000000000085 | 0.811 | 0.498 | 0.123 |
| -0.830000000000085 | 0.813 | 0.502 | 0.127 |
| -0.825000000000085 | 0.815 | 0.506 | 0.13 |
| -0.820000000000085 | 0.817 | 0.51 | 0.133 |
| -0.815000000000085 | 0.819 | 0.515 | 0.136 |
| -0.810000000000085 | 0.821 | 0.519 | 0.14 |
| -0.805000000000085 | 0.823 | 0.523 | 0.143 |
| -0.800000000000085 | 0.825 | 0.527 | 0.147 |
| -0.795000000000085 | 0.827 | 0.532 | 0.15 |
| -0.790000000000085 | 0.829 | 0.536 | 0.154 |
| -0.785000000000085 | 0.831 | 0.54 | 0.157 |
| -0.780000000000085 | 0.833 | 0.544 | 0.161 |
| -0.775000000000085 | 0.835 | 0.548 | 0.165 |
| -0.770000000000085 | 0.837 | 0.553 | 0.169 |
| -0.765000000000085 | 0.839 | 0.557 | 0.173 |
| -0.760000000000085 | 0.841 | 0.561 | 0.177 |
| -0.755000000000085 | 0.843 | 0.566 | 0.181 |
| -0.750000000000085 | 0.845 | 0.57 | 0.185 |
| -0.745000000000085 | 0.847 | 0.574 | 0.189 |
| -0.740000000000085 | 0.849 | 0.578 | 0.193 |
| -0.735000000000085 | 0.85 | 0.583 | 0.198 |
| -0.730000000000085 | 0.852 | 0.587 | 0.202 |
| -0.725000000000085 | 0.854 | 0.591 | 0.207 |
| -0.720000000000085 | 0.856 | 0.595 | 0.211 |
| -0.715000000000085 | 0.858 | 0.6 | 0.216 |
| -0.710000000000085 | 0.86 | 0.604 | 0.22 |
| -0.705000000000085 | 0.861 | 0.608 | 0.225 |
| -0.700000000000085 | 0.863 | 0.613 | 0.23 |
| -0.695000000000085 | 0.865 | 0.617 | 0.235 |
| -0.690000000000085 | 0.867 | 0.621 | 0.24 |
| -0.685000000000085 | 0.869 | 0.625 | 0.245 |
| -0.680000000000085 | 0.87 | 0.63 | 0.25 |
| -0.675000000000085 | 0.872 | 0.634 | 0.255 |
| -0.670000000000085 | 0.874 | 0.638 | 0.26 |
| -0.665000000000085 | 0.876 | 0.643 | 0.265 |
| -0.660000000000085 | 0.877 | 0.647 | 0.271 |
| -0.655000000000085 | 0.879 | 0.651 | 0.276 |
| -0.650000000000085 | 0.881 | 0.655 | 0.282 |
| -0.645000000000085 | 0.883 | 0.66 | 0.287 |
| -0.640000000000085 | 0.884 | 0.664 | 0.293 |
| -0.635000000000085 | 0.886 | 0.668 | 0.298 |
| -0.630000000000085 | 0.888 | 0.672 | 0.304 |
| -0.625000000000085 | 0.889 | 0.677 | 0.31 |
| -0.620000000000085 | 0.891 | 0.681 | 0.316 |
| -0.615000000000085 | 0.893 | 0.685 | 0.322 |
| -0.610000000000085 | 0.894 | 0.689 | 0.327 |
| -0.605000000000085 | 0.896 | 0.693 | 0.334 |
| -0.600000000000085 | 0.898 | 0.698 | 0.34 |
| -0.595000000000085 | 0.899 | 0.702 | 0.346 |
| -0.590000000000085 | 0.901 | 0.706 | 0.352 |
| -0.585000000000085 | 0.902 | 0.71 | 0.358 |
| -0.580000000000085 | 0.904 | 0.714 | 0.365 |
| -0.575000000000085 | 0.906 | 0.718 | 0.371 |
| -0.570000000000085 | 0.907 | 0.723 | 0.377 |
| -0.565000000000085 | 0.909 | 0.727 | 0.384 |
| -0.560000000000085 | 0.91 | 0.731 | 0.39 |
| -0.555000000000085 | 0.912 | 0.735 | 0.397 |
| -0.550000000000085 | 0.913 | 0.739 | 0.404 |
| -0.545000000000085 | 0.915 | 0.743 | 0.41 |
| -0.540000000000085 | 0.916 | 0.747 | 0.417 |
| -0.535000000000085 | 0.918 | 0.751 | 0.424 |
| -0.530000000000085 | 0.919 | 0.755 | 0.431 |
| -0.525000000000085 | 0.921 | 0.759 | 0.437 |
| -0.520000000000085 | 0.922 | 0.763 | 0.444 |
| -0.515000000000085 | 0.924 | 0.767 | 0.451 |
| -0.510000000000085 | 0.925 | 0.771 | 0.458 |
| -0.505000000000085 | 0.926 | 0.775 | 0.465 |
| -0.500000000000085 | 0.928 | 0.779 | 0.472 |
| -0.495000000000085 | 0.929 | 0.783 | 0.479 |
| -0.490000000000085 | 0.931 | 0.787 | 0.487 |
| -0.485000000000085 | 0.932 | 0.79 | 0.494 |
| -0.480000000000085 | 0.933 | 0.794 | 0.501 |
| -0.475000000000085 | 0.935 | 0.798 | 0.508 |
| -0.470000000000085 | 0.936 | 0.802 | 0.515 |
| -0.465000000000085 | 0.937 | 0.806 | 0.523 |
| -0.460000000000085 | 0.938 | 0.809 | 0.53 |
| -0.455000000000085 | 0.94 | 0.813 | 0.537 |
| -0.450000000000085 | 0.941 | 0.817 | 0.545 |
| -0.445000000000085 | 0.942 | 0.82 | 0.552 |
| -0.440000000000085 | 0.944 | 0.824 | 0.559 |
| -0.435000000000085 | 0.945 | 0.828 | 0.567 |
| -0.430000000000085 | 0.946 | 0.831 | 0.574 |
| -0.425000000000085 | 0.947 | 0.835 | 0.582 |
| -0.420000000000085 | 0.948 | 0.838 | 0.589 |
| -0.415000000000085 | 0.95 | 0.842 | 0.597 |
| -0.410000000000085 | 0.951 | 0.845 | 0.604 |
| -0.405000000000085 | 0.952 | 0.849 | 0.611 |
| -0.400000000000085 | 0.953 | 0.852 | 0.619 |
| -0.395000000000085 | 0.954 | 0.856 | 0.626 |
| -0.390000000000085 | 0.955 | 0.859 | 0.634 |
| -0.385000000000085 | 0.957 | 0.862 | 0.641 |
| -0.380000000000085 | 0.958 | 0.866 | 0.648 |
| -0.375000000000085 | 0.959 | 0.869 | 0.656 |
| -0.370000000000085 | 0.96 | 0.872 | 0.663 |
| -0.365000000000085 | 0.961 | 0.875 | 0.671 |
| -0.360000000000085 | 0.962 | 0.878 | 0.678 |
| -0.355000000000085 | 0.963 | 0.882 | 0.685 |
| -0.350000000000085 | 0.964 | 0.885 | 0.692 |
| -0.345000000000085 | 0.965 | 0.888 | 0.7 |
| -0.340000000000085 | 0.966 | 0.891 | 0.707 |
| -0.335000000000085 | 0.967 | 0.894 | 0.714 |
| -0.330000000000085 | 0.968 | 0.897 | 0.721 |
| -0.325000000000085 | 0.969 | 0.9 | 0.728 |
| -0.320000000000085 | 0.97 | 0.903 | 0.736 |
| -0.315000000000085 | 0.971 | 0.906 | 0.743 |
| -0.310000000000085 | 0.972 | 0.908 | 0.75 |
| -0.305000000000085 | 0.972 | 0.911 | 0.756 |
| -0.300000000000085 | 0.973 | 0.914 | 0.763 |
| -0.295000000000085 | 0.974 | 0.917 | 0.77 |
| -0.290000000000085 | 0.975 | 0.919 | 0.777 |
| -0.285000000000085 | 0.976 | 0.922 | 0.784 |
| -0.280000000000085 | 0.977 | 0.925 | 0.79 |
| -0.275000000000085 | 0.978 | 0.927 | 0.797 |
| -0.270000000000085 | 0.978 | 0.93 | 0.804 |
| -0.265000000000085 | 0.979 | 0.932 | 0.81 |
| -0.260000000000085 | 0.98 | 0.935 | 0.816 |
| -0.255000000000085 | 0.981 | 0.937 | 0.823 |
| -0.250000000000085 | 0.981 | 0.939 | 0.829 |
| -0.245000000000085 | 0.982 | 0.942 | 0.835 |
| -0.240000000000085 | 0.983 | 0.944 | 0.841 |
| -0.235000000000085 | 0.984 | 0.946 | 0.847 |
| -0.230000000000085 | 0.984 | 0.948 | 0.853 |
| -0.225000000000085 | 0.985 | 0.951 | 0.859 |
| -0.220000000000085 | 0.986 | 0.953 | 0.865 |
| -0.215000000000085 | 0.986 | 0.955 | 0.871 |
| -0.210000000000085 | 0.987 | 0.957 | 0.876 |
| -0.205000000000085 | 0.987 | 0.959 | 0.882 |
| -0.200000000000085 | 0.988 | 0.961 | 0.887 |
| -0.195000000000085 | 0.989 | 0.963 | 0.892 |
| -0.190000000000085 | 0.989 | 0.965 | 0.897 |
| -0.185000000000085 | 0.99 | 0.966 | 0.902 |
| -0.180000000000085 | 0.99 | 0.968 | 0.907 |
| -0.175000000000085 | 0.991 | 0.97 | 0.912 |
| -0.170000000000085 | 0.991 | 0.972 | 0.917 |
| -0.165000000000085 | 0.992 | 0.973 | 0.922 |
| -0.160000000000085 | 0.992 | 0.975 | 0.926 |
| -0.155000000000084 | 0.993 | 0.976 | 0.93 |
| -0.150000000000084 | 0.993 | 0.978 | 0.935 |
| -0.145000000000084 | 0.994 | 0.979 | 0.939 |
| -0.140000000000084 | 0.994 | 0.981 | 0.943 |
| -0.135000000000084 | 0.995 | 0.982 | 0.947 |
| -0.130000000000084 | 0.995 | 0.983 | 0.951 |
| -0.125000000000084 | 0.995 | 0.984 | 0.954 |
| -0.120000000000084 | 0.996 | 0.986 | 0.958 |
| -0.115000000000084 | 0.996 | 0.987 | 0.961 |
| -0.110000000000084 | 0.996 | 0.988 | 0.964 |
| -0.105000000000084 | 0.997 | 0.989 | 0.967 |
| -0.100000000000084 | 0.997 | 0.99 | 0.97 |
| -0.0950000000000844 | 0.997 | 0.991 | 0.973 |
| -0.0900000000000844 | 0.998 | 0.992 | 0.976 |
| -0.0850000000000844 | 0.998 | 0.993 | 0.979 |
| -0.0800000000000844 | 0.998 | 0.994 | 0.981 |
| -0.0750000000000844 | 0.998 | 0.994 | 0.983 |
| -0.0700000000000844 | 0.999 | 0.995 | 0.985 |
| -0.0650000000000844 | 0.999 | 0.996 | 0.987 |
| -0.0600000000000844 | 0.999 | 0.996 | 0.989 |
| -0.0550000000000844 | 0.999 | 0.997 | 0.991 |
| -0.0500000000000844 | 0.999 | 0.998 | 0.993 |
| -0.0450000000000844 | 0.999 | 0.998 | 0.994 |
| -0.0400000000000844 | 1 | 0.998 | 0.995 |
| -0.0350000000000844 | 1 | 0.999 | 0.996 |
| -0.0300000000000844 | 1 | 0.999 | 0.997 |
| -0.0250000000000844 | 1 | 0.999 | 0.998 |
| -0.0200000000000844 | 1 | 1 | 0.999 |
| -0.0150000000000844 | 1 | 1 | 0.999 |
| -0.0100000000000844 | 1 | 1 | 1 |
| -0.00500000000008444 | 1 | 1 | 1 |
| -8.4444604087075e-14 | 1 | 1 | 1 |
| 0.00499999999991555 | 1 | 1 | 1 |
| 0.00999999999991555 | 1 | 1 | 1 |
| 0.0149999999999156 | 1 | 1 | 0.999 |
| 0.0199999999999156 | 1 | 1 | 0.999 |
| 0.0249999999999156 | 1 | 0.999 | 0.998 |
| 0.0299999999999156 | 1 | 0.999 | 0.997 |
| 0.0349999999999155 | 1 | 0.999 | 0.996 |
| 0.0399999999999155 | 1 | 0.998 | 0.995 |
| 0.0449999999999155 | 0.999 | 0.998 | 0.994 |
| 0.0499999999999155 | 0.999 | 0.998 | 0.993 |
| 0.0549999999999155 | 0.999 | 0.997 | 0.991 |
| 0.0599999999999155 | 0.999 | 0.996 | 0.989 |
| 0.0649999999999155 | 0.999 | 0.996 | 0.987 |
| 0.0699999999999155 | 0.999 | 0.995 | 0.985 |
| 0.0749999999999155 | 0.998 | 0.994 | 0.983 |
| 0.0799999999999155 | 0.998 | 0.994 | 0.981 |
| 0.0849999999999155 | 0.998 | 0.993 | 0.979 |
| 0.0899999999999155 | 0.998 | 0.992 | 0.976 |
| 0.0949999999999155 | 0.997 | 0.991 | 0.973 |
| 0.0999999999999155 | 0.997 | 0.99 | 0.97 |
| 0.104999999999916 | 0.997 | 0.989 | 0.967 |
| 0.109999999999916 | 0.996 | 0.988 | 0.964 |
| 0.114999999999916 | 0.996 | 0.987 | 0.961 |
| 0.119999999999916 | 0.996 | 0.986 | 0.958 |
| 0.124999999999916 | 0.995 | 0.984 | 0.954 |
| 0.129999999999916 | 0.995 | 0.983 | 0.951 |
| 0.134999999999916 | 0.995 | 0.982 | 0.947 |
| 0.139999999999916 | 0.994 | 0.981 | 0.943 |
| 0.144999999999916 | 0.994 | 0.979 | 0.939 |
| 0.149999999999916 | 0.993 | 0.978 | 0.935 |
| 0.154999999999916 | 0.993 | 0.976 | 0.93 |
| 0.159999999999916 | 0.992 | 0.975 | 0.926 |
| 0.164999999999916 | 0.992 | 0.973 | 0.922 |
| 0.169999999999916 | 0.991 | 0.972 | 0.917 |
| 0.174999999999916 | 0.991 | 0.97 | 0.912 |
| 0.179999999999916 | 0.99 | 0.968 | 0.907 |
| 0.184999999999916 | 0.99 | 0.966 | 0.902 |
| 0.189999999999916 | 0.989 | 0.965 | 0.897 |
| 0.194999999999916 | 0.989 | 0.963 | 0.892 |
| 0.199999999999916 | 0.988 | 0.961 | 0.887 |
| 0.204999999999916 | 0.987 | 0.959 | 0.882 |
| 0.209999999999916 | 0.987 | 0.957 | 0.876 |
| 0.214999999999916 | 0.986 | 0.955 | 0.871 |
| 0.219999999999916 | 0.986 | 0.953 | 0.865 |
| 0.224999999999916 | 0.985 | 0.951 | 0.859 |
| 0.229999999999916 | 0.984 | 0.948 | 0.853 |
| 0.234999999999916 | 0.984 | 0.946 | 0.847 |
| 0.239999999999916 | 0.983 | 0.944 | 0.841 |
| 0.244999999999916 | 0.982 | 0.942 | 0.835 |
| 0.249999999999916 | 0.981 | 0.939 | 0.829 |
| 0.254999999999916 | 0.981 | 0.937 | 0.823 |
| 0.259999999999916 | 0.98 | 0.935 | 0.816 |
| 0.264999999999916 | 0.979 | 0.932 | 0.81 |
| 0.269999999999916 | 0.978 | 0.93 | 0.804 |
| 0.274999999999916 | 0.978 | 0.927 | 0.797 |
| 0.279999999999916 | 0.977 | 0.925 | 0.79 |
| 0.284999999999916 | 0.976 | 0.922 | 0.784 |
| 0.289999999999916 | 0.975 | 0.919 | 0.777 |
| 0.294999999999916 | 0.974 | 0.917 | 0.77 |
| 0.299999999999916 | 0.973 | 0.914 | 0.763 |
| 0.304999999999916 | 0.972 | 0.911 | 0.756 |
| 0.309999999999916 | 0.972 | 0.908 | 0.75 |
| 0.314999999999916 | 0.971 | 0.906 | 0.743 |
| 0.319999999999916 | 0.97 | 0.903 | 0.736 |
| 0.324999999999916 | 0.969 | 0.9 | 0.728 |
| 0.329999999999916 | 0.968 | 0.897 | 0.721 |
| 0.334999999999916 | 0.967 | 0.894 | 0.714 |
| 0.339999999999916 | 0.966 | 0.891 | 0.707 |
| 0.344999999999916 | 0.965 | 0.888 | 0.7 |
| 0.349999999999916 | 0.964 | 0.885 | 0.692 |
| 0.354999999999916 | 0.963 | 0.882 | 0.685 |
| 0.359999999999916 | 0.962 | 0.878 | 0.678 |
| 0.364999999999916 | 0.961 | 0.875 | 0.671 |
| 0.369999999999916 | 0.96 | 0.872 | 0.663 |
| 0.374999999999916 | 0.959 | 0.869 | 0.656 |
| 0.379999999999916 | 0.958 | 0.866 | 0.648 |
| 0.384999999999916 | 0.957 | 0.862 | 0.641 |
| 0.389999999999916 | 0.955 | 0.859 | 0.634 |
| 0.394999999999916 | 0.954 | 0.856 | 0.626 |
| 0.399999999999916 | 0.953 | 0.852 | 0.619 |
| 0.404999999999916 | 0.952 | 0.849 | 0.611 |
| 0.409999999999916 | 0.951 | 0.845 | 0.604 |
| 0.414999999999916 | 0.95 | 0.842 | 0.597 |
| 0.419999999999916 | 0.948 | 0.838 | 0.589 |
| 0.424999999999916 | 0.947 | 0.835 | 0.582 |
| 0.429999999999916 | 0.946 | 0.831 | 0.574 |
| 0.434999999999916 | 0.945 | 0.828 | 0.567 |
| 0.439999999999916 | 0.944 | 0.824 | 0.559 |
| 0.444999999999916 | 0.942 | 0.82 | 0.552 |
| 0.449999999999916 | 0.941 | 0.817 | 0.545 |
| 0.454999999999916 | 0.94 | 0.813 | 0.537 |
| 0.459999999999916 | 0.938 | 0.809 | 0.53 |
| 0.464999999999916 | 0.937 | 0.806 | 0.523 |
| 0.469999999999916 | 0.936 | 0.802 | 0.515 |
| 0.474999999999916 | 0.935 | 0.798 | 0.508 |
| 0.479999999999916 | 0.933 | 0.794 | 0.501 |
| 0.484999999999916 | 0.932 | 0.79 | 0.494 |
| 0.489999999999916 | 0.931 | 0.787 | 0.487 |
| 0.494999999999916 | 0.929 | 0.783 | 0.479 |
| 0.499999999999916 | 0.928 | 0.779 | 0.472 |
| 0.504999999999916 | 0.926 | 0.775 | 0.465 |
| 0.509999999999916 | 0.925 | 0.771 | 0.458 |
| 0.514999999999916 | 0.924 | 0.767 | 0.451 |
| 0.519999999999916 | 0.922 | 0.763 | 0.444 |
| 0.524999999999916 | 0.921 | 0.759 | 0.437 |
| 0.529999999999916 | 0.919 | 0.755 | 0.431 |
| 0.534999999999916 | 0.918 | 0.751 | 0.424 |
| 0.539999999999916 | 0.916 | 0.747 | 0.417 |
| 0.544999999999916 | 0.915 | 0.743 | 0.41 |
| 0.549999999999916 | 0.913 | 0.739 | 0.404 |
| 0.554999999999916 | 0.912 | 0.735 | 0.397 |
| 0.559999999999916 | 0.91 | 0.731 | 0.39 |
| 0.564999999999916 | 0.909 | 0.727 | 0.384 |
| 0.569999999999916 | 0.907 | 0.723 | 0.377 |
| 0.574999999999916 | 0.906 | 0.718 | 0.371 |
| 0.579999999999916 | 0.904 | 0.714 | 0.365 |
| 0.584999999999916 | 0.902 | 0.71 | 0.358 |
| 0.589999999999916 | 0.901 | 0.706 | 0.352 |
| 0.594999999999916 | 0.899 | 0.702 | 0.346 |
| 0.599999999999916 | 0.898 | 0.698 | 0.34 |
| 0.604999999999916 | 0.896 | 0.693 | 0.334 |
| 0.609999999999916 | 0.894 | 0.689 | 0.327 |
| 0.614999999999916 | 0.893 | 0.685 | 0.322 |
| 0.619999999999916 | 0.891 | 0.681 | 0.316 |
| 0.624999999999916 | 0.889 | 0.677 | 0.31 |
| 0.629999999999916 | 0.888 | 0.672 | 0.304 |
| 0.634999999999916 | 0.886 | 0.668 | 0.298 |
| 0.639999999999916 | 0.884 | 0.664 | 0.293 |
| 0.644999999999916 | 0.883 | 0.66 | 0.287 |
| 0.649999999999916 | 0.881 | 0.655 | 0.282 |
| 0.654999999999916 | 0.879 | 0.651 | 0.276 |
| 0.659999999999916 | 0.877 | 0.647 | 0.271 |
| 0.664999999999916 | 0.876 | 0.643 | 0.265 |
| 0.669999999999916 | 0.874 | 0.638 | 0.26 |
| 0.674999999999916 | 0.872 | 0.634 | 0.255 |
| 0.679999999999916 | 0.87 | 0.63 | 0.25 |
| 0.684999999999916 | 0.869 | 0.625 | 0.245 |
| 0.689999999999916 | 0.867 | 0.621 | 0.24 |
| 0.694999999999916 | 0.865 | 0.617 | 0.235 |
| 0.699999999999916 | 0.863 | 0.613 | 0.23 |
| 0.704999999999916 | 0.861 | 0.608 | 0.225 |
| 0.709999999999916 | 0.86 | 0.604 | 0.22 |
| 0.714999999999916 | 0.858 | 0.6 | 0.216 |
| 0.719999999999916 | 0.856 | 0.595 | 0.211 |
| 0.724999999999916 | 0.854 | 0.591 | 0.207 |
| 0.729999999999916 | 0.852 | 0.587 | 0.202 |
| 0.734999999999916 | 0.85 | 0.583 | 0.198 |
| 0.739999999999916 | 0.849 | 0.578 | 0.193 |
| 0.744999999999916 | 0.847 | 0.574 | 0.189 |
| 0.749999999999916 | 0.845 | 0.57 | 0.185 |
| 0.754999999999916 | 0.843 | 0.566 | 0.181 |
| 0.759999999999916 | 0.841 | 0.561 | 0.177 |
| 0.764999999999916 | 0.839 | 0.557 | 0.173 |
| 0.769999999999916 | 0.837 | 0.553 | 0.169 |
| 0.774999999999916 | 0.835 | 0.548 | 0.165 |
| 0.779999999999916 | 0.833 | 0.544 | 0.161 |
| 0.784999999999916 | 0.831 | 0.54 | 0.157 |
| 0.789999999999916 | 0.829 | 0.536 | 0.154 |
| 0.794999999999916 | 0.827 | 0.532 | 0.15 |
| 0.799999999999916 | 0.825 | 0.527 | 0.147 |
| 0.804999999999916 | 0.823 | 0.523 | 0.143 |
| 0.809999999999916 | 0.821 | 0.519 | 0.14 |
| 0.814999999999916 | 0.819 | 0.515 | 0.136 |
| 0.819999999999916 | 0.817 | 0.51 | 0.133 |
| 0.824999999999916 | 0.815 | 0.506 | 0.13 |
| 0.829999999999916 | 0.813 | 0.502 | 0.127 |
| 0.834999999999916 | 0.811 | 0.498 | 0.123 |
| 0.839999999999916 | 0.809 | 0.494 | 0.12 |
| 0.844999999999916 | 0.807 | 0.49 | 0.117 |
| 0.849999999999916 | 0.805 | 0.486 | 0.114 |
| 0.854999999999916 | 0.803 | 0.481 | 0.112 |
| 0.859999999999916 | 0.801 | 0.477 | 0.109 |
| 0.864999999999916 | 0.799 | 0.473 | 0.106 |
| 0.869999999999916 | 0.797 | 0.469 | 0.103 |
| 0.874999999999916 | 0.795 | 0.465 | 0.101 |
| 0.879999999999916 | 0.793 | 0.461 | 0.098 |
| 0.884999999999916 | 0.791 | 0.457 | 0.095 |
| 0.889999999999916 | 0.788 | 0.453 | 0.093 |
| 0.894999999999916 | 0.786 | 0.449 | 0.09 |
| 0.899999999999916 | 0.784 | 0.445 | 0.088 |
| 0.904999999999916 | 0.782 | 0.441 | 0.086 |
| 0.909999999999916 | 0.78 | 0.437 | 0.083 |
| 0.914999999999916 | 0.778 | 0.433 | 0.081 |
| 0.919999999999916 | 0.776 | 0.429 | 0.079 |
| 0.924999999999916 | 0.774 | 0.425 | 0.077 |
| 0.929999999999916 | 0.771 | 0.421 | 0.075 |
| 0.934999999999916 | 0.769 | 0.417 | 0.073 |
| 0.939999999999916 | 0.767 | 0.413 | 0.071 |
| 0.944999999999916 | 0.765 | 0.409 | 0.069 |
| 0.949999999999916 | 0.763 | 0.406 | 0.067 |
| 0.954999999999916 | 0.761 | 0.402 | 0.065 |
| 0.959999999999916 | 0.758 | 0.398 | 0.063 |
| 0.964999999999916 | 0.756 | 0.394 | 0.061 |
| 0.969999999999916 | 0.754 | 0.39 | 0.059 |
| 0.974999999999916 | 0.752 | 0.386 | 0.058 |
| 0.979999999999916 | 0.75 | 0.383 | 0.056 |
| 0.984999999999916 | 0.747 | 0.379 | 0.054 |
| 0.989999999999916 | 0.745 | 0.375 | 0.053 |
| 0.994999999999916 | 0.743 | 0.372 | 0.051 |
| 0.999999999999916 | 0.741 | 0.368 | 0.05 |
| 1.004999999999916 | 0.739 | 0.364 | 0.048 |
| 1.009999999999916 | 0.736 | 0.361 | 0.047 |
| 1.014999999999916 | 0.734 | 0.357 | 0.045 |
| 1.019999999999916 | 0.732 | 0.353 | 0.044 |
| 1.024999999999916 | 0.73 | 0.35 | 0.043 |
| 1.029999999999916 | 0.727 | 0.346 | 0.041 |
| 1.034999999999916 | 0.725 | 0.343 | 0.04 |
| 1.039999999999915 | 0.723 | 0.339 | 0.039 |
| 1.044999999999915 | 0.721 | 0.336 | 0.038 |
| 1.049999999999915 | 0.718 | 0.332 | 0.037 |
| 1.054999999999915 | 0.716 | 0.329 | 0.035 |
| 1.059999999999915 | 0.714 | 0.325 | 0.034 |
| 1.064999999999915 | 0.712 | 0.322 | 0.033 |
| 1.069999999999915 | 0.709 | 0.318 | 0.032 |
| 1.074999999999915 | 0.707 | 0.315 | 0.031 |
| 1.079999999999915 | 0.705 | 0.311 | 0.03 |
| 1.084999999999914 | 0.702 | 0.308 | 0.029 |
| 1.089999999999914 | 0.7 | 0.305 | 0.028 |
| 1.094999999999914 | 0.698 | 0.301 | 0.027 |
| 1.099999999999914 | 0.696 | 0.298 | 0.027 |
| 1.104999999999914 | 0.693 | 0.295 | 0.026 |
| 1.109999999999914 | 0.691 | 0.292 | 0.025 |
| 1.114999999999914 | 0.689 | 0.288 | 0.024 |
| 1.119999999999914 | 0.686 | 0.285 | 0.023 |
| 1.124999999999914 | 0.684 | 0.282 | 0.022 |
| 1.129999999999914 | 0.682 | 0.279 | 0.022 |
| 1.134999999999913 | 0.679 | 0.276 | 0.021 |
| 1.139999999999913 | 0.677 | 0.273 | 0.02 |
| 1.144999999999913 | 0.675 | 0.27 | 0.02 |
| 1.149999999999913 | 0.673 | 0.266 | 0.019 |
| 1.154999999999913 | 0.67 | 0.263 | 0.018 |
| 1.159999999999913 | 0.668 | 0.26 | 0.018 |
| 1.164999999999913 | 0.666 | 0.257 | 0.017 |
| 1.169999999999913 | 0.663 | 0.254 | 0.016 |
| 1.174999999999913 | 0.661 | 0.251 | 0.016 |
| 1.179999999999912 | 0.659 | 0.248 | 0.015 |
| 1.184999999999912 | 0.656 | 0.246 | 0.015 |
| 1.189999999999912 | 0.654 | 0.243 | 0.014 |
| 1.194999999999912 | 0.652 | 0.24 | 0.014 |
| 1.199999999999912 | 0.649 | 0.237 | 0.013 |
| 1.204999999999912 | 0.647 | 0.234 | 0.013 |
| 1.209999999999912 | 0.645 | 0.231 | 0.012 |
| 1.214999999999912 | 0.642 | 0.228 | 0.012 |
| 1.219999999999912 | 0.64 | 0.226 | 0.012 |
| 1.224999999999911 | 0.638 | 0.223 | 0.011 |
| 1.229999999999911 | 0.635 | 0.22 | 0.011 |
| 1.234999999999911 | 0.633 | 0.218 | 0.01 |
| 1.239999999999911 | 0.63 | 0.215 | 0.01 |
| 1.244999999999911 | 0.628 | 0.212 | 0.01 |
| 1.249999999999911 | 0.626 | 0.21 | 0.009 |
| 1.254999999999911 | 0.623 | 0.207 | 0.009 |
| 1.259999999999911 | 0.621 | 0.204 | 0.009 |
| 1.264999999999911 | 0.619 | 0.202 | 0.008 |
| 1.269999999999911 | 0.616 | 0.199 | 0.008 |
| 1.27499999999991 | 0.614 | 0.197 | 0.008 |
| 1.27999999999991 | 0.612 | 0.194 | 0.007 |
| 1.28499999999991 | 0.609 | 0.192 | 0.007 |
| 1.28999999999991 | 0.607 | 0.189 | 0.007 |
| 1.29499999999991 | 0.605 | 0.187 | 0.007 |
| 1.29999999999991 | 0.602 | 0.185 | 0.006 |
| 1.30499999999991 | 0.6 | 0.182 | 0.006 |
| 1.30999999999991 | 0.598 | 0.18 | 0.006 |
| 1.31499999999991 | 0.595 | 0.177 | 0.006 |
| 1.319999999999909 | 0.593 | 0.175 | 0.005 |
| 1.324999999999909 | 0.591 | 0.173 | 0.005 |
| 1.329999999999909 | 0.588 | 0.171 | 0.005 |
| 1.334999999999909 | 0.586 | 0.168 | 0.005 |
| 1.339999999999909 | 0.584 | 0.166 | 0.005 |
| 1.344999999999909 | 0.581 | 0.164 | 0.004 |
| 1.349999999999909 | 0.579 | 0.162 | 0.004 |
| 1.354999999999909 | 0.576 | 0.159 | 0.004 |
| 1.359999999999909 | 0.574 | 0.157 | 0.004 |
| 1.364999999999908 | 0.572 | 0.155 | 0.004 |
| 1.369999999999908 | 0.569 | 0.153 | 0.004 |
| 1.374999999999908 | 0.567 | 0.151 | 0.003 |
| 1.379999999999908 | 0.565 | 0.149 | 0.003 |
| 1.384999999999908 | 0.562 | 0.147 | 0.003 |
| 1.389999999999908 | 0.56 | 0.145 | 0.003 |
| 1.394999999999908 | 0.558 | 0.143 | 0.003 |
| 1.399999999999908 | 0.555 | 0.141 | 0.003 |
| 1.404999999999908 | 0.553 | 0.139 | 0.003 |
| 1.409999999999908 | 0.551 | 0.137 | 0.003 |
| 1.414999999999907 | 0.548 | 0.135 | 0.002 |
| 1.419999999999907 | 0.546 | 0.133 | 0.002 |
| 1.424999999999907 | 0.544 | 0.131 | 0.002 |
| 1.429999999999907 | 0.541 | 0.129 | 0.002 |
| 1.434999999999907 | 0.539 | 0.128 | 0.002 |
| 1.439999999999907 | 0.537 | 0.126 | 0.002 |
| 1.444999999999907 | 0.535 | 0.124 | 0.002 |
| 1.449999999999907 | 0.532 | 0.122 | 0.002 |
| 1.454999999999907 | 0.53 | 0.12 | 0.002 |
| 1.459999999999906 | 0.528 | 0.119 | 0.002 |
| 1.464999999999906 | 0.525 | 0.117 | 0.002 |
| 1.469999999999906 | 0.523 | 0.115 | 0.002 |
| 1.474999999999906 | 0.521 | 0.114 | 0.001 |
| 1.479999999999906 | 0.518 | 0.112 | 0.001 |
| 1.484999999999906 | 0.516 | 0.11 | 0.001 |
| 1.489999999999906 | 0.514 | 0.109 | 0.001 |
| 1.494999999999906 | 0.511 | 0.107 | 0.001 |
| 1.499999999999906 | 0.509 | 0.105 | 0.001 |
| 1.504999999999906 | 0.507 | 0.104 | 0.001 |
| 1.509999999999905 | 0.505 | 0.102 | 0.001 |
| 1.514999999999905 | 0.502 | 0.101 | 0.001 |
| 1.519999999999905 | 0.5 | 0.099 | 0.001 |
| 1.524999999999905 | 0.498 | 0.098 | 0.001 |
| 1.529999999999905 | 0.495 | 0.096 | 0.001 |
| 1.534999999999905 | 0.493 | 0.095 | 0.001 |
| 1.539999999999905 | 0.491 | 0.093 | 0.001 |
| 1.544999999999905 | 0.489 | 0.092 | 0.001 |
| 1.549999999999905 | 0.486 | 0.09 | 0.001 |
| 1.554999999999904 | 0.484 | 0.089 | 0.001 |
| 1.559999999999904 | 0.482 | 0.088 | 0.001 |
| 1.564999999999904 | 0.48 | 0.086 | 0.001 |
| 1.569999999999904 | 0.477 | 0.085 | 0.001 |
| 1.574999999999904 | 0.475 | 0.084 | 0.001 |
| 1.579999999999904 | 0.473 | 0.082 | 0.001 |
| 1.584999999999904 | 0.471 | 0.081 | 0.001 |
| 1.589999999999904 | 0.468 | 0.08 | 0.001 |
| 1.594999999999904 | 0.466 | 0.079 | 0 |
| 1.599999999999903 | 0.464 | 0.077 | 0 |
| 1.604999999999903 | 0.462 | 0.076 | 0 |
| 1.609999999999903 | 0.459 | 0.075 | 0 |
| 1.614999999999903 | 0.457 | 0.074 | 0 |
| 1.619999999999903 | 0.455 | 0.072 | 0 |
| 1.624999999999903 | 0.453 | 0.071 | 0 |
| 1.629999999999903 | 0.451 | 0.07 | 0 |
| 1.634999999999903 | 0.448 | 0.069 | 0 |
| 1.639999999999903 | 0.446 | 0.068 | 0 |
| 1.644999999999902 | 0.444 | 0.067 | 0 |
| 1.649999999999902 | 0.442 | 0.066 | 0 |
| 1.654999999999902 | 0.44 | 0.065 | 0 |
| 1.659999999999902 | 0.437 | 0.064 | 0 |
| 1.664999999999902 | 0.435 | 0.063 | 0 |
| 1.669999999999902 | 0.433 | 0.061 | 0 |
| 1.674999999999902 | 0.431 | 0.06 | 0 |
| 1.679999999999902 | 0.429 | 0.059 | 0 |
| 1.684999999999902 | 0.427 | 0.058 | 0 |
| 1.689999999999901 | 0.425 | 0.057 | 0 |
| 1.694999999999901 | 0.422 | 0.057 | 0 |
| 1.699999999999901 | 0.42 | 0.056 | 0 |
| 1.704999999999901 | 0.418 | 0.055 | 0 |
| 1.709999999999901 | 0.416 | 0.054 | 0 |
| 1.714999999999901 | 0.414 | 0.053 | 0 |
| 1.719999999999901 | 0.412 | 0.052 | 0 |
| 1.724999999999901 | 0.41 | 0.051 | 0 |
| 1.729999999999901 | 0.407 | 0.05 | 0 |
| 1.734999999999901 | 0.405 | 0.049 | 0 |
| 1.7399999999999 | 0.403 | 0.048 | 0 |
| 1.7449999999999 | 0.401 | 0.048 | 0 |
| 1.7499999999999 | 0.399 | 0.047 | 0 |
| 1.7549999999999 | 0.397 | 0.046 | 0 |
| 1.7599999999999 | 0.395 | 0.045 | 0 |
| 1.7649999999999 | 0.393 | 0.044 | 0 |
| 1.7699999999999 | 0.391 | 0.044 | 0 |
| 1.7749999999999 | 0.389 | 0.043 | 0 |
| 1.7799999999999 | 0.387 | 0.042 | 0 |
| 1.784999999999899 | 0.384 | 0.041 | 0 |
| 1.789999999999899 | 0.382 | 0.041 | 0 |
| 1.794999999999899 | 0.38 | 0.04 | 0 |
| 1.799999999999899 | 0.378 | 0.039 | 0 |
| 1.804999999999899 | 0.376 | 0.038 | 0 |
| 1.809999999999899 | 0.374 | 0.038 | 0 |
| 1.814999999999899 | 0.372 | 0.037 | 0 |
| 1.819999999999899 | 0.37 | 0.036 | 0 |
| 1.824999999999899 | 0.368 | 0.036 | 0 |
| 1.829999999999899 | 0.366 | 0.035 | 0 |
| 1.834999999999898 | 0.364 | 0.034 | 0 |
| 1.839999999999898 | 0.362 | 0.034 | 0 |
| 1.844999999999898 | 0.36 | 0.033 | 0 |
| 1.849999999999898 | 0.358 | 0.033 | 0 |
| 1.854999999999898 | 0.356 | 0.032 | 0 |
| 1.859999999999898 | 0.354 | 0.031 | 0 |
| 1.864999999999898 | 0.352 | 0.031 | 0 |
| 1.869999999999898 | 0.35 | 0.03 | 0 |
| 1.874999999999898 | 0.348 | 0.03 | 0 |
| 1.879999999999897 | 0.346 | 0.029 | 0 |
| 1.884999999999897 | 0.344 | 0.029 | 0 |
| 1.889999999999897 | 0.342 | 0.028 | 0 |
| 1.894999999999897 | 0.341 | 0.028 | 0 |
| 1.899999999999897 | 0.339 | 0.027 | 0 |
| 1.904999999999897 | 0.337 | 0.027 | 0 |
| 1.909999999999897 | 0.335 | 0.026 | 0 |
| 1.914999999999897 | 0.333 | 0.026 | 0 |
| 1.919999999999897 | 0.331 | 0.025 | 0 |
| 1.924999999999897 | 0.329 | 0.025 | 0 |
| 1.929999999999896 | 0.327 | 0.024 | 0 |
| 1.934999999999896 | 0.325 | 0.024 | 0 |
| 1.939999999999896 | 0.323 | 0.023 | 0 |
| 1.944999999999896 | 0.321 | 0.023 | 0 |
| 1.949999999999896 | 0.32 | 0.022 | 0 |
| 1.954999999999896 | 0.318 | 0.022 | 0 |
| 1.959999999999896 | 0.316 | 0.021 | 0 |
| 1.964999999999896 | 0.314 | 0.021 | 0 |
| 1.969999999999896 | 0.312 | 0.021 | 0 |
| 1.974999999999895 | 0.31 | 0.02 | 0 |
| 1.979999999999895 | 0.308 | 0.02 | 0 |
| 1.984999999999895 | 0.307 | 0.019 | 0 |
| 1.989999999999895 | 0.305 | 0.019 | 0 |
| 1.994999999999895 | 0.303 | 0.019 | 0 |
| 1.999999999999895 | 0.301 | 0.018 | 0 |
| 2.004999999999895 | 0.299 | 0.018 | 0 |
| 2.009999999999895 | 0.298 | 0.018 | 0 |
| 2.014999999999895 | 0.296 | 0.017 | 0 |
| 2.019999999999895 | 0.294 | 0.017 | 0 |
| 2.024999999999895 | 0.292 | 0.017 | 0 |
| 2.029999999999895 | 0.29 | 0.016 | 0 |
| 2.034999999999894 | 0.289 | 0.016 | 0 |
| 2.039999999999894 | 0.287 | 0.016 | 0 |
| 2.044999999999894 | 0.285 | 0.015 | 0 |
| 2.049999999999894 | 0.283 | 0.015 | 0 |
| 2.054999999999894 | 0.282 | 0.015 | 0 |
| 2.059999999999894 | 0.28 | 0.014 | 0 |
| 2.064999999999894 | 0.278 | 0.014 | 0 |
| 2.069999999999894 | 0.277 | 0.014 | 0 |
| 2.074999999999894 | 0.275 | 0.013 | 0 |
| 2.079999999999893 | 0.273 | 0.013 | 0 |
| 2.084999999999893 | 0.271 | 0.013 | 0 |
| 2.089999999999893 | 0.27 | 0.013 | 0 |
| 2.094999999999893 | 0.268 | 0.012 | 0 |
| 2.099999999999893 | 0.266 | 0.012 | 0 |
| 2.104999999999893 | 0.265 | 0.012 | 0 |
| 2.109999999999893 | 0.263 | 0.012 | 0 |
| 2.114999999999893 | 0.261 | 0.011 | 0 |
| 2.119999999999893 | 0.26 | 0.011 | 0 |
| 2.124999999999893 | 0.258 | 0.011 | 0 |
| 2.129999999999892 | 0.256 | 0.011 | 0 |
| 2.134999999999892 | 0.255 | 0.01 | 0 |
| 2.139999999999892 | 0.253 | 0.01 | 0 |
| 2.144999999999892 | 0.252 | 0.01 | 0 |
| 2.149999999999892 | 0.25 | 0.01 | 0 |
| 2.154999999999892 | 0.248 | 0.01 | 0 |
| 2.159999999999892 | 0.247 | 0.009 | 0 |
| 2.164999999999892 | 0.245 | 0.009 | 0 |
| 2.169999999999892 | 0.243 | 0.009 | 0 |
| 2.174999999999891 | 0.242 | 0.009 | 0 |
| 2.179999999999891 | 0.24 | 0.009 | 0 |
| 2.184999999999891 | 0.239 | 0.008 | 0 |
| 2.189999999999891 | 0.237 | 0.008 | 0 |
| 2.194999999999891 | 0.236 | 0.008 | 0 |
| 2.199999999999891 | 0.234 | 0.008 | 0 |
| 2.204999999999891 | 0.233 | 0.008 | 0 |
| 2.209999999999891 | 0.231 | 0.008 | 0 |
| 2.214999999999891 | 0.229 | 0.007 | 0 |
| 2.21999999999989 | 0.228 | 0.007 | 0 |
| 2.22499999999989 | 0.226 | 0.007 | 0 |
| 2.22999999999989 | 0.225 | 0.007 | 0 |
| 2.23499999999989 | 0.223 | 0.007 | 0 |
| 2.23999999999989 | 0.222 | 0.007 | 0 |
| 2.24499999999989 | 0.22 | 0.006 | 0 |
| 2.24999999999989 | 0.219 | 0.006 | 0 |
| 2.25499999999989 | 0.218 | 0.006 | 0 |
| 2.25999999999989 | 0.216 | 0.006 | 0 |
| 2.26499999999989 | 0.215 | 0.006 | 0 |
| 2.269999999999889 | 0.213 | 0.006 | 0 |
| 2.274999999999889 | 0.212 | 0.006 | 0 |
| 2.279999999999889 | 0.21 | 0.006 | 0 |
| 2.284999999999889 | 0.209 | 0.005 | 0 |
| 2.289999999999889 | 0.207 | 0.005 | 0 |
| 2.294999999999889 | 0.206 | 0.005 | 0 |
| 2.299999999999889 | 0.205 | 0.005 | 0 |
| 2.304999999999889 | 0.203 | 0.005 | 0 |
| 2.309999999999889 | 0.202 | 0.005 | 0 |
| 2.314999999999888 | 0.2 | 0.005 | 0 |
| 2.319999999999888 | 0.199 | 0.005 | 0 |
| 2.324999999999888 | 0.198 | 0.004 | 0 |
| 2.329999999999888 | 0.196 | 0.004 | 0 |
| 2.334999999999888 | 0.195 | 0.004 | 0 |
| 2.339999999999888 | 0.193 | 0.004 | 0 |
| 2.344999999999888 | 0.192 | 0.004 | 0 |
| 2.349999999999888 | 0.191 | 0.004 | 0 |
| 2.354999999999888 | 0.189 | 0.004 | 0 |
| 2.359999999999887 | 0.188 | 0.004 | 0 |
| 2.364999999999887 | 0.187 | 0.004 | 0 |
| 2.369999999999887 | 0.185 | 0.004 | 0 |
| 2.374999999999887 | 0.184 | 0.004 | 0 |
| 2.379999999999887 | 0.183 | 0.003 | 0 |
| 2.384999999999887 | 0.182 | 0.003 | 0 |
| 2.389999999999887 | 0.18 | 0.003 | 0 |
| 2.394999999999887 | 0.179 | 0.003 | 0 |
| 2.399999999999887 | 0.178 | 0.003 | 0 |
| 2.404999999999887 | 0.176 | 0.003 | 0 |
| 2.409999999999886 | 0.175 | 0.003 | 0 |
| 2.414999999999886 | 0.174 | 0.003 | 0 |
| 2.419999999999886 | 0.173 | 0.003 | 0 |
| 2.424999999999886 | 0.171 | 0.003 | 0 |
| 2.429999999999886 | 0.17 | 0.003 | 0 |
| 2.434999999999886 | 0.169 | 0.003 | 0 |
| 2.439999999999886 | 0.168 | 0.003 | 0 |
| 2.444999999999886 | 0.166 | 0.003 | 0 |
| 2.449999999999886 | 0.165 | 0.002 | 0 |
| 2.454999999999885 | 0.164 | 0.002 | 0 |
| 2.459999999999885 | 0.163 | 0.002 | 0 |
| 2.464999999999885 | 0.162 | 0.002 | 0 |
| 2.469999999999885 | 0.16 | 0.002 | 0 |
| 2.474999999999885 | 0.159 | 0.002 | 0 |
| 2.479999999999885 | 0.158 | 0.002 | 0 |
| 2.484999999999885 | 0.157 | 0.002 | 0 |
| 2.489999999999885 | 0.156 | 0.002 | 0 |
| 2.494999999999885 | 0.155 | 0.002 | 0 |
| 2.499999999999884 | 0.153 | 0.002 | 0 |
| 2.504999999999884 | 0.152 | 0.002 | 0 |
| 2.509999999999884 | 0.151 | 0.002 | 0 |
| 2.514999999999884 | 0.15 | 0.002 | 0 |
| 2.519999999999884 | 0.149 | 0.002 | 0 |
| 2.524999999999884 | 0.148 | 0.002 | 0 |
| 2.529999999999884 | 0.147 | 0.002 | 0 |
| 2.534999999999884 | 0.145 | 0.002 | 0 |
| 2.539999999999884 | 0.144 | 0.002 | 0 |
| 2.544999999999884 | 0.143 | 0.002 | 0 |
| 2.549999999999883 | 0.142 | 0.001 | 0 |
| 2.554999999999883 | 0.141 | 0.001 | 0 |
| 2.559999999999883 | 0.14 | 0.001 | 0 |
| 2.564999999999883 | 0.139 | 0.001 | 0 |
| 2.569999999999883 | 0.138 | 0.001 | 0 |
| 2.574999999999883 | 0.137 | 0.001 | 0 |
| 2.579999999999883 | 0.136 | 0.001 | 0 |
| 2.584999999999883 | 0.135 | 0.001 | 0 |
| 2.589999999999883 | 0.134 | 0.001 | 0 |
| 2.594999999999882 | 0.133 | 0.001 | 0 |
| 2.599999999999882 | 0.132 | 0.001 | 0 |
| 2.604999999999882 | 0.131 | 0.001 | 0 |
| 2.609999999999882 | 0.13 | 0.001 | 0 |
| 2.614999999999882 | 0.129 | 0.001 | 0 |
| 2.619999999999882 | 0.128 | 0.001 | 0 |
| 2.624999999999882 | 0.127 | 0.001 | 0 |
| 2.629999999999882 | 0.126 | 0.001 | 0 |
| 2.634999999999882 | 0.125 | 0.001 | 0 |
| 2.639999999999881 | 0.124 | 0.001 | 0 |
| 2.644999999999881 | 0.123 | 0.001 | 0 |
| 2.649999999999881 | 0.122 | 0.001 | 0 |
| 2.654999999999881 | 0.121 | 0.001 | 0 |
| 2.659999999999881 | 0.12 | 0.001 | 0 |
| 2.664999999999881 | 0.119 | 0.001 | 0 |
| 2.669999999999881 | 0.118 | 0.001 | 0 |
| 2.674999999999881 | 0.117 | 0.001 | 0 |
| 2.679999999999881 | 0.116 | 0.001 | 0 |
| 2.68499999999988 | 0.115 | 0.001 | 0 |
| 2.68999999999988 | 0.114 | 0.001 | 0 |
| 2.69499999999988 | 0.113 | 0.001 | 0 |
| 2.69999999999988 | 0.112 | 0.001 | 0 |
| 2.70499999999988 | 0.111 | 0.001 | 0 |
| 2.70999999999988 | 0.11 | 0.001 | 0 |
| 2.71499999999988 | 0.11 | 0.001 | 0 |
| 2.71999999999988 | 0.109 | 0.001 | 0 |
| 2.72499999999988 | 0.108 | 0.001 | 0 |
| 2.72999999999988 | 0.107 | 0.001 | 0 |
| 2.734999999999879 | 0.106 | 0.001 | 0 |
| 2.739999999999879 | 0.105 | 0.001 | 0 |
| 2.744999999999879 | 0.104 | 0.001 | 0 |
| 2.749999999999879 | 0.103 | 0.001 | 0 |
| 2.754999999999879 | 0.103 | 0.001 | 0 |
| 2.759999999999879 | 0.102 | 0 | 0 |
| 2.764999999999879 | 0.101 | 0 | 0 |
| 2.769999999999879 | 0.1 | 0 | 0 |
| 2.774999999999879 | 0.099 | 0 | 0 |
| 2.779999999999878 | 0.098 | 0 | 0 |
| 2.784999999999878 | 0.098 | 0 | 0 |
| 2.789999999999878 | 0.097 | 0 | 0 |
| 2.794999999999878 | 0.096 | 0 | 0 |
| 2.799999999999878 | 0.095 | 0 | 0 |
| 2.804999999999878 | 0.094 | 0 | 0 |
| 2.809999999999878 | 0.094 | 0 | 0 |
| 2.814999999999878 | 0.093 | 0 | 0 |
| 2.819999999999878 | 0.092 | 0 | 0 |
| 2.824999999999878 | 0.091 | 0 | 0 |
| 2.829999999999877 | 0.09 | 0 | 0 |
| 2.834999999999877 | 0.09 | 0 | 0 |
| 2.839999999999877 | 0.089 | 0 | 0 |
| 2.844999999999877 | 0.088 | 0 | 0 |
| 2.849999999999877 | 0.087 | 0 | 0 |
| 2.854999999999877 | 0.087 | 0 | 0 |
| 2.859999999999877 | 0.086 | 0 | 0 |
| 2.864999999999877 | 0.085 | 0 | 0 |
| 2.869999999999877 | 0.084 | 0 | 0 |
| 2.874999999999876 | 0.084 | 0 | 0 |
| 2.879999999999876 | 0.083 | 0 | 0 |
| 2.884999999999876 | 0.082 | 0 | 0 |
| 2.889999999999876 | 0.082 | 0 | 0 |
| 2.894999999999876 | 0.081 | 0 | 0 |
| 2.899999999999876 | 0.08 | 0 | 0 |
| 2.904999999999876 | 0.08 | 0 | 0 |
| 2.909999999999876 | 0.079 | 0 | 0 |
| 2.914999999999876 | 0.078 | 0 | 0 |
| 2.919999999999876 | 0.077 | 0 | 0 |
| 2.924999999999875 | 0.077 | 0 | 0 |
| 2.929999999999875 | 0.076 | 0 | 0 |
| 2.934999999999875 | 0.075 | 0 | 0 |
| 2.939999999999875 | 0.075 | 0 | 0 |
| 2.944999999999875 | 0.074 | 0 | 0 |
| 2.949999999999875 | 0.073 | 0 | 0 |
| 2.954999999999875 | 0.073 | 0 | 0 |
| 2.959999999999875 | 0.072 | 0 | 0 |
| 2.964999999999875 | 0.072 | 0 | 0 |
| 2.969999999999874 | 0.071 | 0 | 0 |
| 2.974999999999874 | 0.07 | 0 | 0 |
| 2.979999999999874 | 0.07 | 0 | 0 |
| 2.984999999999874 | 0.069 | 0 | 0 |
| 2.989999999999874 | 0.068 | 0 | 0 |
| 2.994999999999874 | 0.068 | 0 | 0 |
| 2.999999999999874 | 0.067 | 0 | 0 |
| 3.004999999999874 | 0.067 | 0 | 0 |
| 3.009999999999874 | 0.066 | 0 | 0 |
| 3.014999999999874 | 0.065 | 0 | 0 |
| 3.019999999999873 | 0.065 | 0 | 0 |
| 3.024999999999873 | 0.064 | 0 | 0 |
| 3.029999999999873 | 0.064 | 0 | 0 |
| 3.034999999999873 | 0.063 | 0 | 0 |
| 3.039999999999873 | 0.063 | 0 | 0 |
| 3.044999999999873 | 0.062 | 0 | 0 |
| 3.049999999999873 | 0.061 | 0 | 0 |
| 3.054999999999873 | 0.061 | 0 | 0 |
| 3.059999999999873 | 0.06 | 0 | 0 |
| 3.064999999999872 | 0.06 | 0 | 0 |
| 3.069999999999872 | 0.059 | 0 | 0 |
| 3.074999999999872 | 0.059 | 0 | 0 |
| 3.079999999999872 | 0.058 | 0 | 0 |
| 3.084999999999872 | 0.058 | 0 | 0 |
| 3.089999999999872 | 0.057 | 0 | 0 |
| 3.094999999999872 | 0.056 | 0 | 0 |
| 3.099999999999872 | 0.056 | 0 | 0 |
| 3.104999999999872 | 0.055 | 0 | 0 |
| 3.109999999999872 | 0.055 | 0 | 0 |
| 3.114999999999871 | 0.054 | 0 | 0 |
| 3.119999999999871 | 0.054 | 0 | 0 |
| 3.124999999999871 | 0.053 | 0 | 0 |
| 3.129999999999871 | 0.053 | 0 | 0 |
| 3.134999999999871 | 0.052 | 0 | 0 |
| 3.139999999999871 | 0.052 | 0 | 0 |
| 3.144999999999871 | 0.051 | 0 | 0 |
| 3.149999999999871 | 0.051 | 0 | 0 |
| 3.154999999999871 | 0.05 | 0 | 0 |
| 3.15999999999987 | 0.05 | 0 | 0 |
| 3.16499999999987 | 0.05 | 0 | 0 |
| 3.16999999999987 | 0.049 | 0 | 0 |
| 3.17499999999987 | 0.049 | 0 | 0 |
| 3.17999999999987 | 0.048 | 0 | 0 |
| 3.18499999999987 | 0.048 | 0 | 0 |
| 3.18999999999987 | 0.047 | 0 | 0 |
| 3.19499999999987 | 0.047 | 0 | 0 |
| 3.19999999999987 | 0.046 | 0 | 0 |
| 3.204999999999869 | 0.046 | 0 | 0 |
| 3.209999999999869 | 0.045 | 0 | 0 |
| 3.214999999999869 | 0.045 | 0 | 0 |
| 3.219999999999869 | 0.045 | 0 | 0 |
| 3.224999999999869 | 0.044 | 0 | 0 |
| 3.229999999999869 | 0.044 | 0 | 0 |
| 3.234999999999869 | 0.043 | 0 | 0 |
| 3.239999999999869 | 0.043 | 0 | 0 |
| 3.244999999999869 | 0.042 | 0 | 0 |
| 3.249999999999869 | 0.042 | 0 | 0 |
| 3.254999999999868 | 0.042 | 0 | 0 |
| 3.259999999999868 | 0.041 | 0 | 0 |
| 3.264999999999868 | 0.041 | 0 | 0 |
| 3.269999999999868 | 0.04 | 0 | 0 |
| 3.274999999999868 | 0.04 | 0 | 0 |
| 3.279999999999868 | 0.04 | 0 | 0 |
| 3.284999999999868 | 0.039 | 0 | 0 |
| 3.289999999999868 | 0.039 | 0 | 0 |
| 3.294999999999868 | 0.038 | 0 | 0 |
| 3.299999999999867 | 0.038 | 0 | 0 |
| 3.304999999999867 | 0.038 | 0 | 0 |
| 3.309999999999867 | 0.037 | 0 | 0 |
| 3.314999999999867 | 0.037 | 0 | 0 |
| 3.319999999999867 | 0.037 | 0 | 0 |
| 3.324999999999867 | 0.036 | 0 | 0 |
| 3.329999999999867 | 0.036 | 0 | 0 |
| 3.334999999999867 | 0.036 | 0 | 0 |
| 3.339999999999867 | 0.035 | 0 | 0 |
| 3.344999999999866 | 0.035 | 0 | 0 |
| 3.349999999999866 | 0.035 | 0 | 0 |
| 3.354999999999866 | 0.034 | 0 | 0 |
| 3.359999999999866 | 0.034 | 0 | 0 |
| 3.364999999999866 | 0.033 | 0 | 0 |
| 3.369999999999866 | 0.033 | 0 | 0 |
| 3.374999999999866 | 0.033 | 0 | 0 |
| 3.379999999999866 | 0.032 | 0 | 0 |
| 3.384999999999866 | 0.032 | 0 | 0 |
| 3.389999999999866 | 0.032 | 0 | 0 |
| 3.394999999999865 | 0.031 | 0 | 0 |
| 3.399999999999865 | 0.031 | 0 | 0 |
| 3.404999999999865 | 0.031 | 0 | 0 |
| 3.409999999999865 | 0.031 | 0 | 0 |
| 3.414999999999865 | 0.03 | 0 | 0 |
| 3.419999999999865 | 0.03 | 0 | 0 |
| 3.424999999999865 | 0.03 | 0 | 0 |
| 3.429999999999865 | 0.029 | 0 | 0 |
| 3.434999999999865 | 0.029 | 0 | 0 |
| 3.439999999999864 | 0.029 | 0 | 0 |
| 3.444999999999864 | 0.028 | 0 | 0 |
| 3.449999999999864 | 0.028 | 0 | 0 |
| 3.454999999999864 | 0.028 | 0 | 0 |
| 3.459999999999864 | 0.028 | 0 | 0 |
| 3.464999999999864 | 0.027 | 0 | 0 |
| 3.469999999999864 | 0.027 | 0 | 0 |
| 3.474999999999864 | 0.027 | 0 | 0 |
| 3.479999999999864 | 0.026 | 0 | 0 |
| 3.484999999999864 | 0.026 | 0 | 0 |
| 3.489999999999863 | 0.026 | 0 | 0 |
| 3.494999999999863 | 0.026 | 0 | 0 |
| 3.499999999999863 | 0.025 | 0 | 0 |
| 3.504999999999863 | 0.025 | 0 | 0 |
| 3.509999999999863 | 0.025 | 0 | 0 |
| 3.514999999999863 | 0.025 | 0 | 0 |
| 3.519999999999863 | 0.024 | 0 | 0 |
| 3.524999999999863 | 0.024 | 0 | 0 |
| 3.529999999999863 | 0.024 | 0 | 0 |
| 3.534999999999862 | 0.024 | 0 | 0 |
| 3.539999999999862 | 0.023 | 0 | 0 |
| 3.544999999999862 | 0.023 | 0 | 0 |
| 3.549999999999862 | 0.023 | 0 | 0 |
| 3.554999999999862 | 0.023 | 0 | 0 |
| 3.559999999999862 | 0.022 | 0 | 0 |
| 3.564999999999862 | 0.022 | 0 | 0 |
| 3.569999999999862 | 0.022 | 0 | 0 |
| 3.574999999999862 | 0.022 | 0 | 0 |
| 3.579999999999862 | 0.021 | 0 | 0 |
| 3.584999999999861 | 0.021 | 0 | 0 |
| 3.589999999999861 | 0.021 | 0 | 0 |
| 3.594999999999861 | 0.021 | 0 | 0 |
| 3.599999999999861 | 0.02 | 0 | 0 |
| 3.604999999999861 | 0.02 | 0 | 0 |
| 3.609999999999861 | 0.02 | 0 | 0 |
| 3.614999999999861 | 0.02 | 0 | 0 |
| 3.619999999999861 | 0.02 | 0 | 0 |
| 3.62499999999986 | 0.019 | 0 | 0 |
| 3.62999999999986 | 0.019 | 0 | 0 |
| 3.63499999999986 | 0.019 | 0 | 0 |
| 3.63999999999986 | 0.019 | 0 | 0 |
| 3.64499999999986 | 0.019 | 0 | 0 |
| 3.64999999999986 | 0.018 | 0 | 0 |
| 3.65499999999986 | 0.018 | 0 | 0 |
| 3.65999999999986 | 0.018 | 0 | 0 |
| 3.66499999999986 | 0.018 | 0 | 0 |
| 3.669999999999859 | 0.018 | 0 | 0 |
| 3.674999999999859 | 0.017 | 0 | 0 |
| 3.679999999999859 | 0.017 | 0 | 0 |
| 3.684999999999859 | 0.017 | 0 | 0 |
| 3.689999999999859 | 0.017 | 0 | 0 |
| 3.694999999999859 | 0.017 | 0 | 0 |
| 3.699999999999859 | 0.016 | 0 | 0 |
| 3.704999999999859 | 0.016 | 0 | 0 |
| 3.709999999999859 | 0.016 | 0 | 0 |
| 3.714999999999859 | 0.016 | 0 | 0 |
| 3.719999999999858 | 0.016 | 0 | 0 |
| 3.724999999999858 | 0.016 | 0 | 0 |
| 3.729999999999858 | 0.015 | 0 | 0 |
| 3.734999999999858 | 0.015 | 0 | 0 |
| 3.739999999999858 | 0.015 | 0 | 0 |
| 3.744999999999858 | 0.015 | 0 | 0 |
| 3.749999999999858 | 0.015 | 0 | 0 |
| 3.754999999999858 | 0.015 | 0 | 0 |
| 3.759999999999858 | 0.014 | 0 | 0 |
| 3.764999999999857 | 0.014 | 0 | 0 |
| 3.769999999999857 | 0.014 | 0 | 0 |
| 3.774999999999857 | 0.014 | 0 | 0 |
| 3.779999999999857 | 0.014 | 0 | 0 |
| 3.784999999999857 | 0.014 | 0 | 0 |
| 3.789999999999857 | 0.013 | 0 | 0 |
| 3.794999999999857 | 0.013 | 0 | 0 |
| 3.799999999999857 | 0.013 | 0 | 0 |
| 3.804999999999857 | 0.013 | 0 | 0 |
| 3.809999999999857 | 0.013 | 0 | 0 |
| 3.814999999999856 | 0.013 | 0 | 0 |
| 3.819999999999856 | 0.013 | 0 | 0 |
| 3.824999999999856 | 0.012 | 0 | 0 |
| 3.829999999999856 | 0.012 | 0 | 0 |
| 3.834999999999856 | 0.012 | 0 | 0 |
| 3.839999999999856 | 0.012 | 0 | 0 |
| 3.844999999999856 | 0.012 | 0 | 0 |
| 3.849999999999856 | 0.012 | 0 | 0 |
| 3.854999999999856 | 0.012 | 0 | 0 |
| 3.859999999999855 | 0.011 | 0 | 0 |
| 3.864999999999855 | 0.011 | 0 | 0 |
| 3.869999999999855 | 0.011 | 0 | 0 |
| 3.874999999999855 | 0.011 | 0 | 0 |
| 3.879999999999855 | 0.011 | 0 | 0 |
| 3.884999999999855 | 0.011 | 0 | 0 |
| 3.889999999999855 | 0.011 | 0 | 0 |
| 3.894999999999855 | 0.011 | 0 | 0 |
| 3.899999999999855 | 0.01 | 0 | 0 |
| 3.904999999999855 | 0.01 | 0 | 0 |
| 3.909999999999854 | 0.01 | 0 | 0 |
| 3.914999999999854 | 0.01 | 0 | 0 |
| 3.919999999999854 | 0.01 | 0 | 0 |
| 3.924999999999854 | 0.01 | 0 | 0 |
| 3.929999999999854 | 0.01 | 0 | 0 |
| 3.934999999999854 | 0.01 | 0 | 0 |
| 3.939999999999854 | 0.009 | 0 | 0 |
| 3.944999999999854 | 0.009 | 0 | 0 |
| 3.949999999999854 | 0.009 | 0 | 0 |
| 3.954999999999853 | 0.009 | 0 | 0 |
| 3.959999999999853 | 0.009 | 0 | 0 |
| 3.964999999999853 | 0.009 | 0 | 0 |
| 3.969999999999853 | 0.009 | 0 | 0 |
| 3.974999999999853 | 0.009 | 0 | 0 |
| 3.979999999999853 | 0.009 | 0 | 0 |
| 3.984999999999853 | 0.009 | 0 | 0 |
| 3.989999999999853 | 0.008 | 0 | 0 |
| 3.994999999999853 | 0.008 | 0 | 0 |
| 3.999999999999853 | 0.008 | 0 | 0 |
| 4.004999999999852 | 0.008 | 0 | 0 |
| 4.009999999999852 | 0.008 | 0 | 0 |
| 4.014999999999852 | 0.008 | 0 | 0 |
| 4.019999999999852 | 0.008 | 0 | 0 |
| 4.024999999999852 | 0.008 | 0 | 0 |
| 4.029999999999852 | 0.008 | 0 | 0 |
| 4.034999999999852 | 0.008 | 0 | 0 |
| 4.039999999999851 | 0.007 | 0 | 0 |
| 4.044999999999852 | 0.007 | 0 | 0 |
| 4.049999999999851 | 0.007 | 0 | 0 |
| 4.054999999999851 | 0.007 | 0 | 0 |
| 4.059999999999851 | 0.007 | 0 | 0 |
| 4.064999999999851 | 0.007 | 0 | 0 |
| 4.069999999999851 | 0.007 | 0 | 0 |
| 4.074999999999851 | 0.007 | 0 | 0 |
| 4.07999999999985 | 0.007 | 0 | 0 |
| 4.084999999999851 | 0.007 | 0 | 0 |
| 4.08999999999985 | 0.007 | 0 | 0 |
| 4.094999999999851 | 0.007 | 0 | 0 |
| 4.09999999999985 | 0.006 | 0 | 0 |
| 4.10499999999985 | 0.006 | 0 | 0 |
| 4.10999999999985 | 0.006 | 0 | 0 |
| 4.11499999999985 | 0.006 | 0 | 0 |
| 4.11999999999985 | 0.006 | 0 | 0 |
| 4.12499999999985 | 0.006 | 0 | 0 |
| 4.12999999999985 | 0.006 | 0 | 0 |
| 4.13499999999985 | 0.006 | 0 | 0 |
| 4.13999999999985 | 0.006 | 0 | 0 |
| 4.144999999999849 | 0.006 | 0 | 0 |
| 4.14999999999985 | 0.006 | 0 | 0 |
| 4.154999999999849 | 0.006 | 0 | 0 |
| 4.15999999999985 | 0.006 | 0 | 0 |
| 4.164999999999849 | 0.005 | 0 | 0 |
| 4.169999999999849 | 0.005 | 0 | 0 |
| 4.174999999999849 | 0.005 | 0 | 0 |
| 4.179999999999848 | 0.005 | 0 | 0 |
| 4.184999999999849 | 0.005 | 0 | 0 |
| 4.189999999999848 | 0.005 | 0 | 0 |
| 4.194999999999848 | 0.005 | 0 | 0 |
| 4.199999999999848 | 0.005 | 0 | 0 |
| 4.204999999999848 | 0.005 | 0 | 0 |
| 4.209999999999848 | 0.005 | 0 | 0 |
| 4.214999999999848 | 0.005 | 0 | 0 |
| 4.219999999999847 | 0.005 | 0 | 0 |
| 4.224999999999848 | 0.005 | 0 | 0 |
| 4.229999999999847 | 0.005 | 0 | 0 |
| 4.234999999999847 | 0.005 | 0 | 0 |
| 4.239999999999847 | 0.005 | 0 | 0 |
| 4.244999999999847 | 0.004 | 0 | 0 |
| 4.249999999999847 | 0.004 | 0 | 0 |
| 4.254999999999847 | 0.004 | 0 | 0 |
| 4.259999999999846 | 0.004 | 0 | 0 |
| 4.264999999999847 | 0.004 | 0 | 0 |
| 4.269999999999846 | 0.004 | 0 | 0 |
| 4.274999999999846 | 0.004 | 0 | 0 |
| 4.279999999999846 | 0.004 | 0 | 0 |
| 4.284999999999846 | 0.004 | 0 | 0 |
| 4.289999999999846 | 0.004 | 0 | 0 |
| 4.294999999999846 | 0.004 | 0 | 0 |
| 4.299999999999846 | 0.004 | 0 | 0 |
| 4.304999999999846 | 0.004 | 0 | 0 |
| 4.309999999999845 | 0.004 | 0 | 0 |
| 4.314999999999846 | 0.004 | 0 | 0 |
| 4.319999999999845 | 0.004 | 0 | 0 |
| 4.324999999999846 | 0.004 | 0 | 0 |
| 4.329999999999845 | 0.004 | 0 | 0 |
| 4.334999999999845 | 0.004 | 0 | 0 |
| 4.339999999999845 | 0.004 | 0 | 0 |
| 4.344999999999845 | 0.003 | 0 | 0 |
| 4.349999999999845 | 0.003 | 0 | 0 |
| 4.354999999999845 | 0.003 | 0 | 0 |
| 4.359999999999844 | 0.003 | 0 | 0 |
| 4.364999999999845 | 0.003 | 0 | 0 |
| 4.369999999999844 | 0.003 | 0 | 0 |
| 4.374999999999844 | 0.003 | 0 | 0 |
| 4.379999999999844 | 0.003 | 0 | 0 |
| 4.384999999999844 | 0.003 | 0 | 0 |
| 4.389999999999844 | 0.003 | 0 | 0 |
| 4.394999999999844 | 0.003 | 0 | 0 |
| 4.399999999999844 | 0.003 | 0 | 0 |
| 4.404999999999844 | 0.003 | 0 | 0 |
| 4.409999999999843 | 0.003 | 0 | 0 |
| 4.414999999999844 | 0.003 | 0 | 0 |
| 4.419999999999843 | 0.003 | 0 | 0 |
| 4.424999999999843 | 0.003 | 0 | 0 |
| 4.429999999999843 | 0.003 | 0 | 0 |
| 4.434999999999843 | 0.003 | 0 | 0 |
| 4.439999999999843 | 0.003 | 0 | 0 |
| 4.444999999999843 | 0.003 | 0 | 0 |
| 4.449999999999842 | 0.003 | 0 | 0 |
| 4.454999999999843 | 0.003 | 0 | 0 |
| 4.459999999999842 | 0.003 | 0 | 0 |
| 4.464999999999843 | 0.003 | 0 | 0 |
| 4.469999999999842 | 0.002 | 0 | 0 |
| 4.474999999999842 | 0.002 | 0 | 0 |
| 4.479999999999842 | 0.002 | 0 | 0 |
| 4.484999999999842 | 0.002 | 0 | 0 |
| 4.489999999999842 | 0.002 | 0 | 0 |
| 4.494999999999842 | 0.002 | 0 | 0 |
| 4.499999999999841 | 0.002 | 0 | 0 |
| 4.504999999999842 | 0.002 | 0 | 0 |
| 4.509999999999841 | 0.002 | 0 | 0 |
| 4.514999999999842 | 0.002 | 0 | 0 |
| 4.519999999999841 | 0.002 | 0 | 0 |
| 4.524999999999841 | 0.002 | 0 | 0 |
| 4.529999999999841 | 0.002 | 0 | 0 |
| 4.534999999999841 | 0.002 | 0 | 0 |
| 4.53999999999984 | 0.002 | 0 | 0 |
| 4.544999999999841 | 0.002 | 0 | 0 |
| 4.54999999999984 | 0.002 | 0 | 0 |
| 4.554999999999841 | 0.002 | 0 | 0 |
| 4.55999999999984 | 0.002 | 0 | 0 |
| 4.564999999999841 | 0.002 | 0 | 0 |
| 4.56999999999984 | 0.002 | 0 | 0 |
| 4.57499999999984 | 0.002 | 0 | 0 |
| 4.57999999999984 | 0.002 | 0 | 0 |
| 4.58499999999984 | 0.002 | 0 | 0 |
| 4.58999999999984 | 0.002 | 0 | 0 |
| 4.59499999999984 | 0.002 | 0 | 0 |
| 4.59999999999984 | 0.002 | 0 | 0 |
| 4.60499999999984 | 0.002 | 0 | 0 |
| 4.60999999999984 | 0.002 | 0 | 0 |
| 4.614999999999839 | 0.002 | 0 | 0 |
| 4.61999999999984 | 0.002 | 0 | 0 |
| 4.624999999999839 | 0.002 | 0 | 0 |
| 4.62999999999984 | 0.002 | 0 | 0 |
| 4.634999999999839 | 0.002 | 0 | 0 |
| 4.639999999999838 | 0.002 | 0 | 0 |
| 4.644999999999839 | 0.002 | 0 | 0 |
| 4.649999999999838 | 0.002 | 0 | 0 |
| 4.654999999999839 | 0.002 | 0 | 0 |
| 4.659999999999838 | 0.001 | 0 | 0 |
| 4.664999999999838 | 0.001 | 0 | 0 |
| 4.669999999999838 | 0.001 | 0 | 0 |
| 4.674999999999838 | 0.001 | 0 | 0 |
| 4.679999999999837 | 0.001 | 0 | 0 |
| 4.684999999999838 | 0.001 | 0 | 0 |
| 4.689999999999837 | 0.001 | 0 | 0 |
| 4.694999999999838 | 0.001 | 0 | 0 |
| 4.699999999999837 | 0.001 | 0 | 0 |
| 4.704999999999837 | 0.001 | 0 | 0 |
| 4.709999999999837 | 0.001 | 0 | 0 |
| 4.714999999999837 | 0.001 | 0 | 0 |
| 4.719999999999837 | 0.001 | 0 | 0 |
| 4.724999999999837 | 0.001 | 0 | 0 |
| 4.729999999999836 | 0.001 | 0 | 0 |
| 4.734999999999836 | 0.001 | 0 | 0 |
| 4.739999999999836 | 0.001 | 0 | 0 |
| 4.744999999999836 | 0.001 | 0 | 0 |
| 4.749999999999836 | 0.001 | 0 | 0 |
| 4.754999999999836 | 0.001 | 0 | 0 |
| 4.759999999999836 | 0.001 | 0 | 0 |
| 4.764999999999836 | 0.001 | 0 | 0 |
| 4.769999999999836 | 0.001 | 0 | 0 |
| 4.774999999999835 | 0.001 | 0 | 0 |
| 4.779999999999835 | 0.001 | 0 | 0 |
| 4.784999999999835 | 0.001 | 0 | 0 |
| 4.789999999999835 | 0.001 | 0 | 0 |
| 4.794999999999835 | 0.001 | 0 | 0 |
| 4.799999999999835 | 0.001 | 0 | 0 |
| 4.804999999999835 | 0.001 | 0 | 0 |
| 4.809999999999835 | 0.001 | 0 | 0 |
| 4.814999999999835 | 0.001 | 0 | 0 |
| 4.819999999999835 | 0.001 | 0 | 0 |
| 4.824999999999835 | 0.001 | 0 | 0 |
| 4.829999999999834 | 0.001 | 0 | 0 |
| 4.834999999999834 | 0.001 | 0 | 0 |
| 4.839999999999834 | 0.001 | 0 | 0 |
| 4.844999999999834 | 0.001 | 0 | 0 |
| 4.849999999999834 | 0.001 | 0 | 0 |
| 4.854999999999834 | 0.001 | 0 | 0 |
| 4.859999999999834 | 0.001 | 0 | 0 |
| 4.864999999999834 | 0.001 | 0 | 0 |
| 4.869999999999834 | 0.001 | 0 | 0 |
| 4.874999999999834 | 0.001 | 0 | 0 |
| 4.879999999999833 | 0.001 | 0 | 0 |
| 4.884999999999834 | 0.001 | 0 | 0 |
| 4.889999999999833 | 0.001 | 0 | 0 |
| 4.894999999999833 | 0.001 | 0 | 0 |
| 4.899999999999833 | 0.001 | 0 | 0 |
| 4.904999999999833 | 0.001 | 0 | 0 |
| 4.909999999999833 | 0.001 | 0 | 0 |
| 4.914999999999833 | 0.001 | 0 | 0 |
| 4.919999999999832 | 0.001 | 0 | 0 |
| 4.924999999999833 | 0.001 | 0 | 0 |
| 4.929999999999832 | 0.001 | 0 | 0 |
| 4.934999999999832 | 0.001 | 0 | 0 |
| 4.939999999999832 | 0.001 | 0 | 0 |
| 4.944999999999832 | 0.001 | 0 | 0 |
| 4.949999999999832 | 0.001 | 0 | 0 |
| 4.954999999999832 | 0.001 | 0 | 0 |
| 4.959999999999832 | 0.001 | 0 | 0 |
| 4.964999999999832 | 0.001 | 0 | 0 |
| 4.969999999999831 | 0.001 | 0 | 0 |
| 4.974999999999831 | 0.001 | 0 | 0 |
| 4.97999999999983 | 0.001 | 0 | 0 |
| 4.984999999999831 | 0.001 | 0 | 0 |
| 4.98999999999983 | 0.001 | 0 | 0 |
| 4.994999999999831 | 0.001 | 0 | 0 |
| 4.99999999999983 | 0.001 | 0 | 0 |